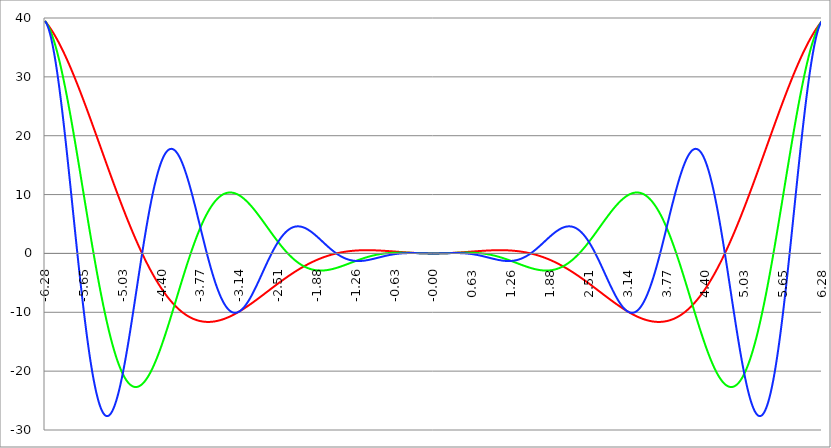
| Category | Series 1 | Series 0 | Series 2 |
|---|---|---|---|
| -6.283185307179586 | 39.478 | 39.478 | 39.478 |
| -6.276902121872407 | 39.399 | 39.396 | 39.393 |
| -6.270618936565228 | 39.318 | 39.308 | 39.293 |
| -6.264335751258049 | 39.235 | 39.214 | 39.179 |
| -6.25805256595087 | 39.151 | 39.114 | 39.052 |
| -6.25176938064369 | 39.065 | 39.007 | 38.911 |
| -6.245486195336511 | 38.978 | 38.895 | 38.757 |
| -6.23920301002933 | 38.89 | 38.777 | 38.589 |
| -6.232919824722153 | 38.8 | 38.653 | 38.408 |
| -6.226636639414973 | 38.709 | 38.523 | 38.214 |
| -6.220353454107794 | 38.616 | 38.388 | 38.007 |
| -6.214070268800615 | 38.522 | 38.246 | 37.788 |
| -6.207787083493435 | 38.427 | 38.099 | 37.555 |
| -6.201503898186257 | 38.33 | 37.947 | 37.31 |
| -6.195220712879077 | 38.232 | 37.788 | 37.052 |
| -6.188937527571898 | 38.133 | 37.624 | 36.782 |
| -6.182654342264719 | 38.032 | 37.455 | 36.5 |
| -6.17637115695754 | 37.93 | 37.28 | 36.206 |
| -6.170087971650361 | 37.827 | 37.1 | 35.9 |
| -6.163804786343182 | 37.722 | 36.915 | 35.582 |
| -6.157521601036002 | 37.616 | 36.724 | 35.253 |
| -6.151238415728823 | 37.509 | 36.528 | 34.912 |
| -6.144955230421644 | 37.4 | 36.327 | 34.56 |
| -6.138672045114464 | 37.29 | 36.12 | 34.197 |
| -6.132388859807286 | 37.179 | 35.909 | 33.823 |
| -6.126105674500106 | 37.067 | 35.692 | 33.439 |
| -6.119822489192927 | 36.954 | 35.471 | 33.044 |
| -6.113539303885748 | 36.839 | 35.245 | 32.639 |
| -6.107256118578569 | 36.723 | 35.013 | 32.223 |
| -6.10097293327139 | 36.606 | 34.777 | 31.798 |
| -6.09468974796421 | 36.487 | 34.537 | 31.363 |
| -6.088406562657031 | 36.368 | 34.291 | 30.918 |
| -6.082123377349852 | 36.247 | 34.041 | 30.464 |
| -6.075840192042672 | 36.125 | 33.787 | 30.001 |
| -6.069557006735494 | 36.002 | 33.528 | 29.529 |
| -6.063273821428314 | 35.878 | 33.264 | 29.049 |
| -6.056990636121135 | 35.753 | 32.997 | 28.56 |
| -6.050707450813956 | 35.626 | 32.724 | 28.062 |
| -6.044424265506777 | 35.499 | 32.448 | 27.557 |
| -6.038141080199597 | 35.37 | 32.168 | 27.043 |
| -6.031857894892418 | 35.24 | 31.883 | 26.522 |
| -6.025574709585239 | 35.109 | 31.594 | 25.994 |
| -6.01929152427806 | 34.978 | 31.302 | 25.458 |
| -6.013008338970881 | 34.845 | 31.005 | 24.916 |
| -6.006725153663701 | 34.711 | 30.705 | 24.367 |
| -6.000441968356522 | 34.576 | 30.4 | 23.811 |
| -5.994158783049343 | 34.44 | 30.092 | 23.249 |
| -5.987875597742164 | 34.303 | 29.781 | 22.681 |
| -5.981592412434984 | 34.165 | 29.466 | 22.107 |
| -5.975309227127805 | 34.025 | 29.147 | 21.527 |
| -5.969026041820626 | 33.885 | 28.825 | 20.942 |
| -5.962742856513447 | 33.744 | 28.499 | 20.352 |
| -5.956459671206268 | 33.602 | 28.17 | 19.758 |
| -5.950176485899088 | 33.46 | 27.838 | 19.158 |
| -5.94389330059191 | 33.316 | 27.503 | 18.554 |
| -5.93761011528473 | 33.171 | 27.165 | 17.946 |
| -5.931326929977551 | 33.025 | 26.823 | 17.334 |
| -5.925043744670372 | 32.879 | 26.479 | 16.719 |
| -5.918760559363193 | 32.731 | 26.132 | 16.1 |
| -5.912477374056014 | 32.583 | 25.782 | 15.478 |
| -5.906194188748834 | 32.434 | 25.429 | 14.853 |
| -5.899911003441655 | 32.283 | 25.073 | 14.225 |
| -5.893627818134476 | 32.132 | 24.715 | 13.594 |
| -5.887344632827297 | 31.981 | 24.354 | 12.962 |
| -5.881061447520117 | 31.828 | 23.991 | 12.327 |
| -5.874778262212938 | 31.674 | 23.626 | 11.691 |
| -5.868495076905759 | 31.52 | 23.258 | 11.053 |
| -5.86221189159858 | 31.365 | 22.888 | 10.414 |
| -5.855928706291401 | 31.209 | 22.516 | 9.774 |
| -5.849645520984221 | 31.053 | 22.141 | 9.133 |
| -5.843362335677042 | 30.895 | 21.765 | 8.491 |
| -5.837079150369863 | 30.737 | 21.386 | 7.85 |
| -5.830795965062684 | 30.578 | 21.006 | 7.208 |
| -5.824512779755505 | 30.419 | 20.624 | 6.566 |
| -5.818229594448325 | 30.258 | 20.24 | 5.925 |
| -5.811946409141146 | 30.097 | 19.855 | 5.284 |
| -5.805663223833967 | 29.935 | 19.468 | 4.644 |
| -5.799380038526788 | 29.773 | 19.079 | 4.006 |
| -5.793096853219609 | 29.61 | 18.689 | 3.368 |
| -5.78681366791243 | 29.446 | 18.297 | 2.732 |
| -5.780530482605251 | 29.281 | 17.904 | 2.098 |
| -5.774247297298071 | 29.116 | 17.51 | 1.466 |
| -5.767964111990892 | 28.951 | 17.115 | 0.836 |
| -5.761680926683713 | 28.784 | 16.719 | 0.209 |
| -5.755397741376534 | 28.617 | 16.321 | -0.416 |
| -5.749114556069355 | 28.45 | 15.923 | -1.038 |
| -5.742831370762175 | 28.281 | 15.524 | -1.657 |
| -5.736548185454996 | 28.113 | 15.124 | -2.273 |
| -5.730265000147816 | 27.943 | 14.723 | -2.885 |
| -5.723981814840638 | 27.773 | 14.322 | -3.493 |
| -5.717698629533459 | 27.603 | 13.92 | -4.097 |
| -5.711415444226279 | 27.432 | 13.517 | -4.698 |
| -5.7051322589191 | 27.26 | 13.114 | -5.294 |
| -5.698849073611921 | 27.088 | 12.711 | -5.885 |
| -5.692565888304742 | 26.916 | 12.307 | -6.472 |
| -5.686282702997562 | 26.743 | 11.903 | -7.053 |
| -5.679999517690383 | 26.569 | 11.499 | -7.63 |
| -5.673716332383204 | 26.395 | 11.094 | -8.201 |
| -5.667433147076025 | 26.221 | 10.69 | -8.767 |
| -5.661149961768846 | 26.046 | 10.286 | -9.327 |
| -5.654866776461667 | 25.87 | 9.882 | -9.882 |
| -5.648583591154487 | 25.695 | 9.478 | -10.43 |
| -5.642300405847308 | 25.518 | 9.074 | -10.972 |
| -5.63601722054013 | 25.342 | 8.67 | -11.508 |
| -5.62973403523295 | 25.165 | 8.267 | -12.037 |
| -5.623450849925771 | 24.987 | 7.864 | -12.559 |
| -5.617167664618591 | 24.809 | 7.462 | -13.075 |
| -5.610884479311412 | 24.631 | 7.06 | -13.583 |
| -5.604601294004233 | 24.453 | 6.659 | -14.084 |
| -5.598318108697054 | 24.274 | 6.259 | -14.578 |
| -5.592034923389875 | 24.095 | 5.86 | -15.065 |
| -5.585751738082695 | 23.915 | 5.461 | -15.544 |
| -5.579468552775516 | 23.735 | 5.063 | -16.015 |
| -5.573185367468337 | 23.555 | 4.666 | -16.478 |
| -5.566902182161157 | 23.375 | 4.27 | -16.933 |
| -5.560618996853979 | 23.194 | 3.875 | -17.38 |
| -5.5543358115468 | 23.013 | 3.482 | -17.818 |
| -5.54805262623962 | 22.831 | 3.089 | -18.249 |
| -5.54176944093244 | 22.65 | 2.698 | -18.67 |
| -5.535486255625262 | 22.468 | 2.308 | -19.083 |
| -5.529203070318083 | 22.286 | 1.92 | -19.487 |
| -5.522919885010904 | 22.104 | 1.533 | -19.883 |
| -5.516636699703724 | 21.921 | 1.147 | -20.269 |
| -5.510353514396545 | 21.739 | 0.763 | -20.646 |
| -5.504070329089366 | 21.556 | 0.381 | -21.014 |
| -5.497787143782186 | 21.373 | 0 | -21.373 |
| -5.491503958475008 | 21.19 | -0.379 | -21.722 |
| -5.485220773167828 | 21.006 | -0.756 | -22.062 |
| -5.47893758786065 | 20.823 | -1.131 | -22.392 |
| -5.47265440255347 | 20.639 | -1.505 | -22.713 |
| -5.466371217246291 | 20.455 | -1.876 | -23.024 |
| -5.460088031939112 | 20.271 | -2.246 | -23.325 |
| -5.453804846631932 | 20.087 | -2.613 | -23.616 |
| -5.447521661324753 | 19.903 | -2.978 | -23.898 |
| -5.441238476017574 | 19.719 | -3.341 | -24.169 |
| -5.434955290710395 | 19.534 | -3.702 | -24.431 |
| -5.428672105403215 | 19.35 | -4.061 | -24.682 |
| -5.422388920096036 | 19.165 | -4.417 | -24.924 |
| -5.416105734788857 | 18.981 | -4.771 | -25.155 |
| -5.409822549481678 | 18.796 | -5.122 | -25.376 |
| -5.403539364174499 | 18.612 | -5.471 | -25.587 |
| -5.39725617886732 | 18.427 | -5.818 | -25.787 |
| -5.39097299356014 | 18.242 | -6.161 | -25.977 |
| -5.384689808252961 | 18.058 | -6.503 | -26.157 |
| -5.378406622945782 | 17.873 | -6.841 | -26.327 |
| -5.372123437638603 | 17.688 | -7.177 | -26.486 |
| -5.365840252331424 | 17.504 | -7.51 | -26.635 |
| -5.359557067024244 | 17.319 | -7.841 | -26.774 |
| -5.353273881717065 | 17.134 | -8.168 | -26.902 |
| -5.346990696409886 | 16.95 | -8.493 | -27.02 |
| -5.340707511102707 | 16.765 | -8.814 | -27.127 |
| -5.334424325795528 | 16.581 | -9.133 | -27.224 |
| -5.328141140488348 | 16.397 | -9.448 | -27.311 |
| -5.32185795518117 | 16.213 | -9.761 | -27.388 |
| -5.31557476987399 | 16.028 | -10.071 | -27.454 |
| -5.30929158456681 | 15.844 | -10.377 | -27.51 |
| -5.303008399259631 | 15.66 | -10.68 | -27.555 |
| -5.296725213952453 | 15.477 | -10.98 | -27.591 |
| -5.290442028645273 | 15.293 | -11.277 | -27.616 |
| -5.284158843338094 | 15.109 | -11.57 | -27.631 |
| -5.277875658030915 | 14.926 | -11.86 | -27.636 |
| -5.271592472723735 | 14.743 | -12.147 | -27.631 |
| -5.265309287416557 | 14.56 | -12.431 | -27.616 |
| -5.259026102109377 | 14.377 | -12.711 | -27.591 |
| -5.252742916802198 | 14.194 | -12.987 | -27.556 |
| -5.246459731495019 | 14.012 | -13.26 | -27.512 |
| -5.24017654618784 | 13.829 | -13.53 | -27.457 |
| -5.23389336088066 | 13.647 | -13.796 | -27.393 |
| -5.227610175573481 | 13.465 | -14.059 | -27.319 |
| -5.221326990266302 | 13.284 | -14.317 | -27.236 |
| -5.215043804959122 | 13.102 | -14.573 | -27.143 |
| -5.208760619651944 | 12.921 | -14.824 | -27.041 |
| -5.202477434344764 | 12.74 | -15.072 | -26.929 |
| -5.196194249037585 | 12.559 | -15.317 | -26.808 |
| -5.189911063730406 | 12.379 | -15.557 | -26.678 |
| -5.183627878423227 | 12.199 | -15.794 | -26.539 |
| -5.177344693116048 | 12.019 | -16.027 | -26.391 |
| -5.171061507808868 | 11.839 | -16.256 | -26.234 |
| -5.164778322501689 | 11.66 | -16.481 | -26.069 |
| -5.15849513719451 | 11.481 | -16.703 | -25.894 |
| -5.152211951887331 | 11.302 | -16.921 | -25.711 |
| -5.145928766580152 | 11.124 | -17.134 | -25.52 |
| -5.139645581272972 | 10.946 | -17.344 | -25.32 |
| -5.133362395965793 | 10.768 | -17.55 | -25.112 |
| -5.127079210658614 | 10.591 | -17.752 | -24.896 |
| -5.120796025351435 | 10.414 | -17.951 | -24.672 |
| -5.114512840044256 | 10.238 | -18.145 | -24.44 |
| -5.108229654737076 | 10.061 | -18.335 | -24.201 |
| -5.101946469429897 | 9.886 | -18.521 | -23.954 |
| -5.095663284122718 | 9.71 | -18.703 | -23.699 |
| -5.08938009881554 | 9.535 | -18.882 | -23.437 |
| -5.08309691350836 | 9.36 | -19.056 | -23.167 |
| -5.07681372820118 | 9.186 | -19.226 | -22.891 |
| -5.070530542894002 | 9.012 | -19.392 | -22.607 |
| -5.064247357586822 | 8.839 | -19.554 | -22.317 |
| -5.057964172279643 | 8.666 | -19.712 | -22.02 |
| -5.051680986972464 | 8.493 | -19.866 | -21.717 |
| -5.045397801665285 | 8.321 | -20.016 | -21.407 |
| -5.039114616358106 | 8.15 | -20.162 | -21.091 |
| -5.032831431050926 | 7.978 | -20.303 | -20.769 |
| -5.026548245743747 | 7.808 | -20.441 | -20.441 |
| -5.020265060436568 | 7.637 | -20.574 | -20.107 |
| -5.013981875129389 | 7.468 | -20.704 | -19.767 |
| -5.00769868982221 | 7.298 | -20.829 | -19.422 |
| -5.00141550451503 | 7.13 | -20.95 | -19.072 |
| -4.995132319207851 | 6.961 | -21.067 | -18.716 |
| -4.98884913390067 | 6.793 | -21.18 | -18.356 |
| -4.982565948593493 | 6.626 | -21.289 | -17.99 |
| -4.976282763286313 | 6.459 | -21.394 | -17.62 |
| -4.969999577979134 | 6.293 | -21.494 | -17.245 |
| -4.963716392671955 | 6.127 | -21.591 | -16.866 |
| -4.957433207364776 | 5.962 | -21.683 | -16.483 |
| -4.951150022057597 | 5.798 | -21.772 | -16.095 |
| -4.944866836750418 | 5.633 | -21.856 | -15.704 |
| -4.938583651443238 | 5.47 | -21.936 | -15.309 |
| -4.932300466136059 | 5.307 | -22.012 | -14.911 |
| -4.92601728082888 | 5.144 | -22.084 | -14.509 |
| -4.9197340955217 | 4.983 | -22.152 | -14.103 |
| -4.913450910214521 | 4.821 | -22.216 | -13.695 |
| -4.907167724907342 | 4.661 | -22.276 | -13.284 |
| -4.900884539600163 | 4.501 | -22.332 | -12.87 |
| -4.894601354292984 | 4.341 | -22.384 | -12.453 |
| -4.888318168985805 | 4.182 | -22.432 | -12.034 |
| -4.882034983678625 | 4.024 | -22.475 | -11.613 |
| -4.875751798371446 | 3.866 | -22.515 | -11.19 |
| -4.869468613064267 | 3.709 | -22.551 | -10.765 |
| -4.863185427757088 | 3.553 | -22.583 | -10.338 |
| -4.856902242449909 | 3.397 | -22.611 | -9.91 |
| -4.85061905714273 | 3.242 | -22.635 | -9.48 |
| -4.84433587183555 | 3.087 | -22.655 | -9.049 |
| -4.838052686528371 | 2.934 | -22.671 | -8.617 |
| -4.831769501221192 | 2.78 | -22.684 | -8.184 |
| -4.825486315914013 | 2.628 | -22.692 | -7.75 |
| -4.819203130606833 | 2.476 | -22.697 | -7.315 |
| -4.812919945299654 | 2.325 | -22.698 | -6.881 |
| -4.806636759992475 | 2.174 | -22.695 | -6.446 |
| -4.800353574685296 | 2.024 | -22.688 | -6.011 |
| -4.794070389378117 | 1.875 | -22.677 | -5.576 |
| -4.787787204070938 | 1.727 | -22.663 | -5.141 |
| -4.781504018763758 | 1.579 | -22.645 | -4.707 |
| -4.77522083345658 | 1.432 | -22.623 | -4.273 |
| -4.7689376481494 | 1.285 | -22.597 | -3.84 |
| -4.762654462842221 | 1.14 | -22.568 | -3.408 |
| -4.756371277535042 | 0.995 | -22.536 | -2.976 |
| -4.750088092227862 | 0.85 | -22.499 | -2.546 |
| -4.743804906920683 | 0.707 | -22.459 | -2.118 |
| -4.737521721613504 | 0.564 | -22.416 | -1.691 |
| -4.731238536306324 | 0.422 | -22.369 | -1.265 |
| -4.724955350999146 | 0.281 | -22.318 | -0.841 |
| -4.718672165691966 | 0.14 | -22.264 | -0.42 |
| -4.712388980384787 | 0 | -22.207 | 0 |
| -4.706105795077608 | -0.139 | -22.146 | 0.417 |
| -4.699822609770429 | -0.278 | -22.081 | 0.833 |
| -4.69353942446325 | -0.415 | -22.014 | 1.245 |
| -4.68725623915607 | -0.552 | -21.943 | 1.655 |
| -4.680973053848891 | -0.688 | -21.868 | 2.062 |
| -4.674689868541712 | -0.824 | -21.791 | 2.466 |
| -4.668406683234533 | -0.958 | -21.71 | 2.867 |
| -4.662123497927354 | -1.092 | -21.626 | 3.265 |
| -4.655840312620174 | -1.225 | -21.538 | 3.66 |
| -4.649557127312995 | -1.357 | -21.448 | 4.051 |
| -4.643273942005816 | -1.489 | -21.354 | 4.438 |
| -4.636990756698637 | -1.62 | -21.258 | 4.822 |
| -4.630707571391458 | -1.75 | -21.158 | 5.202 |
| -4.624424386084279 | -1.879 | -21.055 | 5.578 |
| -4.618141200777099 | -2.007 | -20.949 | 5.95 |
| -4.61185801546992 | -2.135 | -20.841 | 6.318 |
| -4.605574830162741 | -2.261 | -20.729 | 6.681 |
| -4.599291644855561 | -2.387 | -20.615 | 7.04 |
| -4.593008459548383 | -2.512 | -20.497 | 7.395 |
| -4.586725274241203 | -2.637 | -20.377 | 7.745 |
| -4.580442088934024 | -2.76 | -20.254 | 8.09 |
| -4.574158903626845 | -2.883 | -20.128 | 8.43 |
| -4.567875718319666 | -3.005 | -20 | 8.765 |
| -4.561592533012487 | -3.126 | -19.869 | 9.096 |
| -4.555309347705307 | -3.246 | -19.735 | 9.421 |
| -4.549026162398128 | -3.366 | -19.599 | 9.741 |
| -4.542742977090949 | -3.484 | -19.46 | 10.055 |
| -4.53645979178377 | -3.602 | -19.319 | 10.364 |
| -4.530176606476591 | -3.719 | -19.175 | 10.668 |
| -4.523893421169412 | -3.835 | -19.028 | 10.966 |
| -4.517610235862232 | -3.95 | -18.88 | 11.258 |
| -4.511327050555053 | -4.065 | -18.729 | 11.545 |
| -4.505043865247874 | -4.178 | -18.575 | 11.826 |
| -4.498760679940694 | -4.291 | -18.419 | 12.101 |
| -4.492477494633515 | -4.403 | -18.262 | 12.37 |
| -4.486194309326336 | -4.514 | -18.101 | 12.633 |
| -4.479911124019157 | -4.624 | -17.939 | 12.89 |
| -4.473627938711977 | -4.733 | -17.775 | 13.14 |
| -4.467344753404799 | -4.842 | -17.608 | 13.385 |
| -4.46106156809762 | -4.949 | -17.439 | 13.623 |
| -4.45477838279044 | -5.056 | -17.269 | 13.855 |
| -4.44849519748326 | -5.162 | -17.096 | 14.081 |
| -4.442212012176082 | -5.267 | -16.922 | 14.3 |
| -4.435928826868903 | -5.371 | -16.745 | 14.512 |
| -4.429645641561723 | -5.474 | -16.567 | 14.718 |
| -4.423362456254544 | -5.577 | -16.387 | 14.918 |
| -4.417079270947365 | -5.678 | -16.205 | 15.111 |
| -4.410796085640185 | -5.779 | -16.022 | 15.297 |
| -4.404512900333007 | -5.879 | -15.837 | 15.477 |
| -4.398229715025827 | -5.978 | -15.65 | 15.65 |
| -4.391946529718648 | -6.076 | -15.462 | 15.816 |
| -4.38566334441147 | -6.173 | -15.272 | 15.976 |
| -4.37938015910429 | -6.269 | -15.08 | 16.128 |
| -4.373096973797111 | -6.365 | -14.887 | 16.274 |
| -4.366813788489932 | -6.459 | -14.693 | 16.414 |
| -4.360530603182752 | -6.553 | -14.497 | 16.546 |
| -4.354247417875573 | -6.646 | -14.3 | 16.671 |
| -4.347964232568394 | -6.738 | -14.102 | 16.79 |
| -4.341681047261215 | -6.829 | -13.902 | 16.902 |
| -4.335397861954035 | -6.919 | -13.701 | 17.007 |
| -4.329114676646856 | -7.008 | -13.499 | 17.105 |
| -4.322831491339677 | -7.097 | -13.296 | 17.196 |
| -4.316548306032498 | -7.184 | -13.092 | 17.281 |
| -4.310265120725319 | -7.271 | -12.887 | 17.358 |
| -4.30398193541814 | -7.357 | -12.681 | 17.429 |
| -4.29769875011096 | -7.442 | -12.474 | 17.493 |
| -4.291415564803781 | -7.526 | -12.265 | 17.55 |
| -4.285132379496602 | -7.609 | -12.056 | 17.601 |
| -4.278849194189422 | -7.691 | -11.847 | 17.644 |
| -4.272566008882244 | -7.773 | -11.636 | 17.681 |
| -4.266282823575064 | -7.853 | -11.425 | 17.712 |
| -4.259999638267885 | -7.933 | -11.213 | 17.735 |
| -4.253716452960706 | -8.011 | -11 | 17.752 |
| -4.247433267653527 | -8.089 | -10.787 | 17.762 |
| -4.241150082346347 | -8.166 | -10.573 | 17.766 |
| -4.234866897039168 | -8.242 | -10.358 | 17.763 |
| -4.228583711731989 | -8.317 | -10.143 | 17.754 |
| -4.22230052642481 | -8.392 | -9.928 | 17.738 |
| -4.216017341117631 | -8.465 | -9.712 | 17.716 |
| -4.209734155810452 | -8.538 | -9.496 | 17.687 |
| -4.203450970503273 | -8.609 | -9.279 | 17.652 |
| -4.197167785196093 | -8.68 | -9.062 | 17.611 |
| -4.190884599888914 | -8.75 | -8.845 | 17.563 |
| -4.184601414581734 | -8.819 | -8.628 | 17.51 |
| -4.178318229274556 | -8.887 | -8.411 | 17.45 |
| -4.172035043967377 | -8.954 | -8.193 | 17.384 |
| -4.165751858660197 | -9.021 | -7.975 | 17.312 |
| -4.159468673353018 | -9.086 | -7.758 | 17.234 |
| -4.153185488045839 | -9.151 | -7.54 | 17.151 |
| -4.14690230273866 | -9.215 | -7.322 | 17.061 |
| -4.140619117431481 | -9.277 | -7.104 | 16.966 |
| -4.134335932124301 | -9.339 | -6.887 | 16.865 |
| -4.128052746817122 | -9.4 | -6.669 | 16.759 |
| -4.121769561509943 | -9.461 | -6.452 | 16.647 |
| -4.115486376202764 | -9.52 | -6.235 | 16.529 |
| -4.109203190895584 | -9.579 | -6.018 | 16.407 |
| -4.102920005588405 | -9.636 | -5.802 | 16.278 |
| -4.096636820281226 | -9.693 | -5.586 | 16.145 |
| -4.090353634974047 | -9.749 | -5.37 | 16.007 |
| -4.084070449666868 | -9.804 | -5.154 | 15.863 |
| -4.077787264359689 | -9.858 | -4.939 | 15.715 |
| -4.071504079052509 | -9.912 | -4.725 | 15.562 |
| -4.06522089374533 | -9.964 | -4.511 | 15.403 |
| -4.058937708438151 | -10.016 | -4.297 | 15.241 |
| -4.052654523130972 | -10.066 | -4.084 | 15.073 |
| -4.046371337823793 | -10.116 | -3.872 | 14.901 |
| -4.040088152516613 | -10.165 | -3.661 | 14.725 |
| -4.033804967209434 | -10.214 | -3.45 | 14.544 |
| -4.027521781902255 | -10.261 | -3.239 | 14.359 |
| -4.021238596595076 | -10.307 | -3.03 | 14.17 |
| -4.014955411287897 | -10.353 | -2.821 | 13.977 |
| -4.008672225980717 | -10.398 | -2.613 | 13.78 |
| -4.002389040673538 | -10.442 | -2.406 | 13.579 |
| -3.996105855366359 | -10.485 | -2.2 | 13.374 |
| -3.989822670059179 | -10.527 | -1.995 | 13.166 |
| -3.983539484752 | -10.569 | -1.791 | 12.954 |
| -3.97725629944482 | -10.609 | -1.588 | 12.739 |
| -3.97097311413764 | -10.649 | -1.385 | 12.52 |
| -3.96468992883046 | -10.688 | -1.184 | 12.298 |
| -3.958406743523281 | -10.726 | -0.984 | 12.073 |
| -3.952123558216101 | -10.763 | -0.785 | 11.845 |
| -3.945840372908922 | -10.8 | -0.587 | 11.614 |
| -3.939557187601742 | -10.836 | -0.39 | 11.38 |
| -3.933274002294562 | -10.87 | -0.194 | 11.144 |
| -3.926990816987382 | -10.904 | 0 | 10.904 |
| -3.920707631680203 | -10.938 | 0.193 | 10.663 |
| -3.914424446373023 | -10.97 | 0.385 | 10.419 |
| -3.908141261065844 | -11.002 | 0.576 | 10.172 |
| -3.901858075758664 | -11.032 | 0.765 | 9.924 |
| -3.895574890451484 | -11.062 | 0.953 | 9.673 |
| -3.889291705144305 | -11.092 | 1.139 | 9.421 |
| -3.883008519837125 | -11.12 | 1.325 | 9.166 |
| -3.876725334529945 | -11.148 | 1.508 | 8.91 |
| -3.870442149222766 | -11.174 | 1.691 | 8.652 |
| -3.864158963915586 | -11.2 | 1.871 | 8.393 |
| -3.857875778608407 | -11.226 | 2.051 | 8.132 |
| -3.851592593301227 | -11.25 | 2.229 | 7.87 |
| -3.845309407994047 | -11.274 | 2.405 | 7.607 |
| -3.839026222686868 | -11.297 | 2.58 | 7.342 |
| -3.832743037379688 | -11.319 | 2.753 | 7.077 |
| -3.826459852072508 | -11.34 | 2.924 | 6.811 |
| -3.820176666765329 | -11.361 | 3.094 | 6.544 |
| -3.813893481458149 | -11.38 | 3.262 | 6.276 |
| -3.807610296150969 | -11.4 | 3.429 | 6.008 |
| -3.80132711084379 | -11.418 | 3.594 | 5.739 |
| -3.79504392553661 | -11.435 | 3.757 | 5.47 |
| -3.78876074022943 | -11.452 | 3.918 | 5.2 |
| -3.782477554922251 | -11.468 | 4.078 | 4.931 |
| -3.776194369615071 | -11.483 | 4.236 | 4.661 |
| -3.769911184307892 | -11.498 | 4.392 | 4.392 |
| -3.763627999000712 | -11.512 | 4.546 | 4.122 |
| -3.757344813693532 | -11.525 | 4.699 | 3.853 |
| -3.751061628386352 | -11.537 | 4.849 | 3.585 |
| -3.744778443079173 | -11.549 | 4.998 | 3.317 |
| -3.738495257771993 | -11.56 | 5.145 | 3.049 |
| -3.732212072464814 | -11.57 | 5.29 | 2.782 |
| -3.725928887157634 | -11.579 | 5.433 | 2.516 |
| -3.719645701850454 | -11.588 | 5.575 | 2.25 |
| -3.713362516543275 | -11.596 | 5.714 | 1.986 |
| -3.707079331236095 | -11.603 | 5.851 | 1.722 |
| -3.700796145928915 | -11.61 | 5.987 | 1.46 |
| -3.694512960621736 | -11.616 | 6.12 | 1.199 |
| -3.688229775314556 | -11.621 | 6.252 | 0.939 |
| -3.681946590007376 | -11.625 | 6.381 | 0.681 |
| -3.675663404700197 | -11.629 | 6.509 | 0.424 |
| -3.669380219393017 | -11.632 | 6.634 | 0.169 |
| -3.663097034085838 | -11.635 | 6.758 | -0.084 |
| -3.656813848778658 | -11.636 | 6.879 | -0.336 |
| -3.650530663471478 | -11.637 | 6.999 | -0.586 |
| -3.644247478164299 | -11.638 | 7.116 | -0.834 |
| -3.63796429285712 | -11.638 | 7.231 | -1.08 |
| -3.631681107549939 | -11.637 | 7.345 | -1.324 |
| -3.62539792224276 | -11.635 | 7.456 | -1.565 |
| -3.61911473693558 | -11.633 | 7.565 | -1.805 |
| -3.612831551628401 | -11.63 | 7.672 | -2.042 |
| -3.606548366321221 | -11.626 | 7.777 | -2.277 |
| -3.600265181014041 | -11.622 | 7.88 | -2.509 |
| -3.593981995706862 | -11.617 | 7.981 | -2.738 |
| -3.587698810399682 | -11.612 | 8.079 | -2.965 |
| -3.581415625092502 | -11.606 | 8.176 | -3.19 |
| -3.575132439785323 | -11.599 | 8.27 | -3.411 |
| -3.568849254478143 | -11.592 | 8.363 | -3.63 |
| -3.562566069170964 | -11.584 | 8.453 | -3.846 |
| -3.556282883863784 | -11.575 | 8.541 | -4.059 |
| -3.549999698556604 | -11.566 | 8.627 | -4.269 |
| -3.543716513249425 | -11.556 | 8.711 | -4.476 |
| -3.537433327942245 | -11.546 | 8.793 | -4.68 |
| -3.531150142635065 | -11.535 | 8.872 | -4.88 |
| -3.524866957327886 | -11.523 | 8.95 | -5.077 |
| -3.518583772020706 | -11.511 | 9.025 | -5.271 |
| -3.512300586713526 | -11.498 | 9.098 | -5.462 |
| -3.506017401406347 | -11.485 | 9.169 | -5.649 |
| -3.499734216099167 | -11.471 | 9.238 | -5.833 |
| -3.493451030791987 | -11.456 | 9.305 | -6.013 |
| -3.487167845484808 | -11.441 | 9.37 | -6.19 |
| -3.480884660177628 | -11.426 | 9.432 | -6.363 |
| -3.474601474870449 | -11.41 | 9.493 | -6.533 |
| -3.468318289563269 | -11.393 | 9.551 | -6.699 |
| -3.462035104256089 | -11.376 | 9.607 | -6.861 |
| -3.45575191894891 | -11.358 | 9.661 | -7.019 |
| -3.44946873364173 | -11.339 | 9.713 | -7.174 |
| -3.44318554833455 | -11.32 | 9.763 | -7.325 |
| -3.436902363027371 | -11.301 | 9.811 | -7.472 |
| -3.430619177720191 | -11.281 | 9.857 | -7.615 |
| -3.424335992413011 | -11.26 | 9.901 | -7.755 |
| -3.418052807105832 | -11.239 | 9.942 | -7.89 |
| -3.411769621798652 | -11.218 | 9.982 | -8.021 |
| -3.405486436491473 | -11.196 | 10.019 | -8.149 |
| -3.399203251184293 | -11.173 | 10.055 | -8.272 |
| -3.392920065877113 | -11.15 | 10.088 | -8.392 |
| -3.386636880569934 | -11.127 | 10.119 | -8.507 |
| -3.380353695262754 | -11.103 | 10.149 | -8.619 |
| -3.374070509955574 | -11.078 | 10.176 | -8.726 |
| -3.367787324648395 | -11.053 | 10.201 | -8.829 |
| -3.361504139341215 | -11.028 | 10.224 | -8.929 |
| -3.355220954034035 | -11.002 | 10.246 | -9.024 |
| -3.348937768726855 | -10.975 | 10.265 | -9.115 |
| -3.342654583419676 | -10.948 | 10.282 | -9.202 |
| -3.336371398112496 | -10.921 | 10.297 | -9.284 |
| -3.330088212805317 | -10.893 | 10.311 | -9.363 |
| -3.323805027498137 | -10.865 | 10.322 | -9.438 |
| -3.317521842190957 | -10.836 | 10.332 | -9.508 |
| -3.311238656883778 | -10.807 | 10.339 | -9.575 |
| -3.304955471576598 | -10.777 | 10.345 | -9.637 |
| -3.298672286269419 | -10.747 | 10.349 | -9.695 |
| -3.292389100962239 | -10.717 | 10.351 | -9.749 |
| -3.286105915655059 | -10.686 | 10.351 | -9.799 |
| -3.27982273034788 | -10.655 | 10.349 | -9.845 |
| -3.2735395450407 | -10.623 | 10.345 | -9.887 |
| -3.26725635973352 | -10.591 | 10.34 | -9.925 |
| -3.260973174426341 | -10.558 | 10.332 | -9.959 |
| -3.254689989119161 | -10.525 | 10.323 | -9.989 |
| -3.248406803811982 | -10.492 | 10.312 | -10.015 |
| -3.242123618504802 | -10.458 | 10.3 | -10.037 |
| -3.235840433197622 | -10.424 | 10.285 | -10.055 |
| -3.229557247890442 | -10.39 | 10.269 | -10.069 |
| -3.223274062583263 | -10.355 | 10.251 | -10.079 |
| -3.216990877276083 | -10.32 | 10.232 | -10.085 |
| -3.210707691968904 | -10.284 | 10.21 | -10.088 |
| -3.204424506661724 | -10.248 | 10.187 | -10.086 |
| -3.198141321354544 | -10.212 | 10.163 | -10.081 |
| -3.191858136047365 | -10.175 | 10.137 | -10.072 |
| -3.185574950740185 | -10.138 | 10.109 | -10.06 |
| -3.179291765433005 | -10.101 | 10.079 | -10.043 |
| -3.173008580125826 | -10.063 | 10.048 | -10.023 |
| -3.166725394818646 | -10.025 | 10.015 | -10 |
| -3.160442209511467 | -9.987 | 9.981 | -9.972 |
| -3.154159024204287 | -9.948 | 9.946 | -9.942 |
| -3.147875838897107 | -9.909 | 9.908 | -9.907 |
| -3.141592653589928 | -9.87 | 9.87 | -9.87 |
| -3.135309468282748 | -9.83 | 9.829 | -9.828 |
| -3.129026282975568 | -9.79 | 9.788 | -9.784 |
| -3.122743097668389 | -9.75 | 9.745 | -9.736 |
| -3.116459912361209 | -9.709 | 9.7 | -9.685 |
| -3.110176727054029 | -9.668 | 9.654 | -9.63 |
| -3.10389354174685 | -9.627 | 9.607 | -9.573 |
| -3.09761035643967 | -9.586 | 9.558 | -9.512 |
| -3.09132717113249 | -9.544 | 9.508 | -9.448 |
| -3.085043985825311 | -9.502 | 9.457 | -9.381 |
| -3.078760800518131 | -9.46 | 9.404 | -9.311 |
| -3.072477615210952 | -9.418 | 9.35 | -9.238 |
| -3.066194429903772 | -9.375 | 9.295 | -9.162 |
| -3.059911244596592 | -9.332 | 9.238 | -9.083 |
| -3.053628059289413 | -9.289 | 9.181 | -9.002 |
| -3.047344873982233 | -9.245 | 9.122 | -8.918 |
| -3.041061688675053 | -9.201 | 9.062 | -8.831 |
| -3.034778503367874 | -9.157 | 9.001 | -8.741 |
| -3.028495318060694 | -9.113 | 8.938 | -8.649 |
| -3.022212132753515 | -9.069 | 8.875 | -8.554 |
| -3.015928947446335 | -9.024 | 8.81 | -8.457 |
| -3.009645762139155 | -8.979 | 8.744 | -8.358 |
| -3.003362576831975 | -8.934 | 8.678 | -8.256 |
| -2.997079391524796 | -8.889 | 8.61 | -8.151 |
| -2.990796206217616 | -8.843 | 8.541 | -8.045 |
| -2.984513020910436 | -8.798 | 8.471 | -7.936 |
| -2.978229835603257 | -8.752 | 8.401 | -7.826 |
| -2.971946650296077 | -8.706 | 8.329 | -7.713 |
| -2.965663464988898 | -8.659 | 8.256 | -7.598 |
| -2.959380279681718 | -8.613 | 8.183 | -7.482 |
| -2.953097094374538 | -8.566 | 8.108 | -7.363 |
| -2.946813909067359 | -8.52 | 8.033 | -7.243 |
| -2.94053072376018 | -8.473 | 7.957 | -7.121 |
| -2.934247538453 | -8.425 | 7.88 | -6.997 |
| -2.92796435314582 | -8.378 | 7.802 | -6.872 |
| -2.92168116783864 | -8.331 | 7.724 | -6.745 |
| -2.915397982531461 | -8.283 | 7.645 | -6.617 |
| -2.909114797224281 | -8.235 | 7.565 | -6.487 |
| -2.902831611917101 | -8.187 | 7.484 | -6.356 |
| -2.896548426609922 | -8.139 | 7.402 | -6.223 |
| -2.890265241302742 | -8.091 | 7.32 | -6.09 |
| -2.883982055995562 | -8.043 | 7.238 | -5.955 |
| -2.877698870688383 | -7.994 | 7.154 | -5.819 |
| -2.871415685381203 | -7.946 | 7.07 | -5.682 |
| -2.865132500074023 | -7.897 | 6.986 | -5.544 |
| -2.858849314766844 | -7.848 | 6.901 | -5.405 |
| -2.852566129459664 | -7.8 | 6.815 | -5.265 |
| -2.846282944152485 | -7.751 | 6.729 | -5.125 |
| -2.839999758845305 | -7.702 | 6.642 | -4.983 |
| -2.833716573538125 | -7.652 | 6.555 | -4.841 |
| -2.827433388230946 | -7.603 | 6.468 | -4.699 |
| -2.821150202923766 | -7.554 | 6.38 | -4.556 |
| -2.814867017616586 | -7.504 | 6.291 | -4.412 |
| -2.808583832309407 | -7.455 | 6.202 | -4.268 |
| -2.802300647002227 | -7.405 | 6.113 | -4.124 |
| -2.796017461695047 | -7.356 | 6.024 | -3.98 |
| -2.789734276387867 | -7.306 | 5.934 | -3.835 |
| -2.783451091080688 | -7.256 | 5.844 | -3.69 |
| -2.777167905773509 | -7.206 | 5.753 | -3.545 |
| -2.770884720466329 | -7.156 | 5.662 | -3.399 |
| -2.764601535159149 | -7.106 | 5.572 | -3.254 |
| -2.75831834985197 | -7.056 | 5.48 | -3.109 |
| -2.75203516454479 | -7.006 | 5.389 | -2.964 |
| -2.74575197923761 | -6.956 | 5.297 | -2.819 |
| -2.739468793930431 | -6.906 | 5.206 | -2.675 |
| -2.733185608623251 | -6.856 | 5.114 | -2.53 |
| -2.726902423316071 | -6.806 | 5.022 | -2.387 |
| -2.720619238008892 | -6.756 | 4.93 | -2.243 |
| -2.714336052701712 | -6.705 | 4.837 | -2.1 |
| -2.708052867394532 | -6.655 | 4.745 | -1.957 |
| -2.701769682087352 | -6.605 | 4.653 | -1.815 |
| -2.695486496780173 | -6.555 | 4.561 | -1.674 |
| -2.689203311472993 | -6.504 | 4.468 | -1.533 |
| -2.682920126165814 | -6.454 | 4.376 | -1.393 |
| -2.676636940858634 | -6.404 | 4.284 | -1.254 |
| -2.670353755551454 | -6.354 | 4.191 | -1.116 |
| -2.664070570244275 | -6.303 | 4.099 | -0.978 |
| -2.657787384937095 | -6.253 | 4.007 | -0.841 |
| -2.651504199629916 | -6.203 | 3.915 | -0.706 |
| -2.645221014322736 | -6.153 | 3.823 | -0.571 |
| -2.638937829015556 | -6.103 | 3.731 | -0.437 |
| -2.632654643708377 | -6.052 | 3.64 | -0.305 |
| -2.626371458401197 | -6.002 | 3.549 | -0.173 |
| -2.620088273094018 | -5.952 | 3.457 | -0.043 |
| -2.613805087786838 | -5.902 | 3.366 | 0.086 |
| -2.607521902479658 | -5.852 | 3.276 | 0.214 |
| -2.601238717172478 | -5.802 | 3.185 | 0.34 |
| -2.594955531865299 | -5.753 | 3.095 | 0.465 |
| -2.588672346558119 | -5.703 | 3.005 | 0.589 |
| -2.58238916125094 | -5.653 | 2.915 | 0.711 |
| -2.57610597594376 | -5.603 | 2.826 | 0.832 |
| -2.56982279063658 | -5.554 | 2.737 | 0.951 |
| -2.563539605329401 | -5.504 | 2.648 | 1.069 |
| -2.557256420022221 | -5.455 | 2.559 | 1.185 |
| -2.550973234715042 | -5.405 | 2.471 | 1.3 |
| -2.544690049407862 | -5.356 | 2.384 | 1.413 |
| -2.538406864100682 | -5.306 | 2.297 | 1.524 |
| -2.532123678793503 | -5.257 | 2.21 | 1.634 |
| -2.525840493486323 | -5.208 | 2.123 | 1.741 |
| -2.519557308179143 | -5.159 | 2.037 | 1.848 |
| -2.513274122871964 | -5.11 | 1.952 | 1.952 |
| -2.506990937564784 | -5.061 | 1.867 | 2.054 |
| -2.500707752257604 | -5.013 | 1.782 | 2.155 |
| -2.494424566950425 | -4.964 | 1.698 | 2.254 |
| -2.488141381643245 | -4.915 | 1.615 | 2.351 |
| -2.481858196336065 | -4.867 | 1.532 | 2.446 |
| -2.475575011028886 | -4.819 | 1.449 | 2.539 |
| -2.469291825721706 | -4.771 | 1.367 | 2.631 |
| -2.463008640414527 | -4.722 | 1.286 | 2.72 |
| -2.456725455107347 | -4.675 | 1.205 | 2.807 |
| -2.450442269800167 | -4.627 | 1.125 | 2.893 |
| -2.444159084492988 | -4.579 | 1.046 | 2.976 |
| -2.437875899185808 | -4.531 | 0.967 | 3.057 |
| -2.431592713878628 | -4.484 | 0.888 | 3.137 |
| -2.425309528571449 | -4.437 | 0.81 | 3.214 |
| -2.419026343264269 | -4.389 | 0.733 | 3.289 |
| -2.412743157957089 | -4.342 | 0.657 | 3.362 |
| -2.40645997264991 | -4.295 | 0.581 | 3.433 |
| -2.40017678734273 | -4.249 | 0.506 | 3.502 |
| -2.393893602035551 | -4.202 | 0.432 | 3.569 |
| -2.387610416728371 | -4.156 | 0.358 | 3.634 |
| -2.381327231421191 | -4.109 | 0.285 | 3.696 |
| -2.375044046114012 | -4.063 | 0.213 | 3.757 |
| -2.368760860806832 | -4.017 | 0.141 | 3.815 |
| -2.362477675499652 | -3.971 | 0.07 | 3.871 |
| -2.356194490192473 | -3.926 | 0 | 3.926 |
| -2.349911304885293 | -3.88 | -0.069 | 3.978 |
| -2.343628119578113 | -3.835 | -0.138 | 4.027 |
| -2.337344934270934 | -3.79 | -0.206 | 4.075 |
| -2.331061748963754 | -3.745 | -0.273 | 4.121 |
| -2.324778563656574 | -3.7 | -0.339 | 4.164 |
| -2.318495378349395 | -3.655 | -0.405 | 4.206 |
| -2.312212193042215 | -3.611 | -0.47 | 4.245 |
| -2.305929007735036 | -3.566 | -0.534 | 4.282 |
| -2.299645822427856 | -3.522 | -0.597 | 4.317 |
| -2.293362637120676 | -3.478 | -0.659 | 4.35 |
| -2.287079451813496 | -3.434 | -0.721 | 4.381 |
| -2.280796266506317 | -3.391 | -0.781 | 4.41 |
| -2.274513081199137 | -3.347 | -0.841 | 4.436 |
| -2.268229895891957 | -3.304 | -0.9 | 4.461 |
| -2.261946710584778 | -3.261 | -0.959 | 4.484 |
| -2.255663525277598 | -3.219 | -1.016 | 4.504 |
| -2.249380339970419 | -3.176 | -1.073 | 4.523 |
| -2.24309715466324 | -3.134 | -1.128 | 4.539 |
| -2.23681396935606 | -3.091 | -1.183 | 4.554 |
| -2.23053078404888 | -3.049 | -1.237 | 4.566 |
| -2.2242475987417 | -3.008 | -1.29 | 4.577 |
| -2.217964413434521 | -2.966 | -1.343 | 4.585 |
| -2.211681228127341 | -2.925 | -1.394 | 4.592 |
| -2.205398042820161 | -2.884 | -1.445 | 4.597 |
| -2.199114857512981 | -2.843 | -1.494 | 4.599 |
| -2.192831672205802 | -2.802 | -1.543 | 4.6 |
| -2.186548486898622 | -2.761 | -1.591 | 4.599 |
| -2.180265301591443 | -2.721 | -1.638 | 4.597 |
| -2.173982116284263 | -2.681 | -1.684 | 4.592 |
| -2.167698930977084 | -2.641 | -1.73 | 4.586 |
| -2.161415745669904 | -2.602 | -1.774 | 4.578 |
| -2.155132560362724 | -2.562 | -1.818 | 4.568 |
| -2.148849375055545 | -2.523 | -1.86 | 4.556 |
| -2.142566189748365 | -2.484 | -1.902 | 4.543 |
| -2.136283004441185 | -2.445 | -1.943 | 4.528 |
| -2.129999819134006 | -2.407 | -1.983 | 4.511 |
| -2.123716633826826 | -2.369 | -2.022 | 4.493 |
| -2.117433448519646 | -2.331 | -2.061 | 4.473 |
| -2.111150263212467 | -2.293 | -2.098 | 4.451 |
| -2.104867077905287 | -2.255 | -2.134 | 4.428 |
| -2.098583892598107 | -2.218 | -2.17 | 4.404 |
| -2.092300707290928 | -2.181 | -2.205 | 4.378 |
| -2.086017521983748 | -2.144 | -2.239 | 4.35 |
| -2.079734336676569 | -2.108 | -2.272 | 4.321 |
| -2.073451151369389 | -2.071 | -2.304 | 4.291 |
| -2.06716796606221 | -2.035 | -2.335 | 4.259 |
| -2.06088478075503 | -1.999 | -2.365 | 4.226 |
| -2.05460159544785 | -1.964 | -2.395 | 4.191 |
| -2.04831841014067 | -1.928 | -2.423 | 4.156 |
| -2.042035224833491 | -1.893 | -2.451 | 4.119 |
| -2.035752039526311 | -1.858 | -2.478 | 4.08 |
| -2.029468854219131 | -1.824 | -2.504 | 4.041 |
| -2.023185668911951 | -1.789 | -2.529 | 4 |
| -2.016902483604772 | -1.755 | -2.553 | 3.958 |
| -2.010619298297592 | -1.721 | -2.577 | 3.916 |
| -2.004336112990412 | -1.688 | -2.599 | 3.872 |
| -1.998052927683233 | -1.654 | -2.621 | 3.827 |
| -1.991769742376054 | -1.621 | -2.642 | 3.781 |
| -1.985486557068874 | -1.588 | -2.662 | 3.734 |
| -1.979203371761694 | -1.556 | -2.682 | 3.686 |
| -1.972920186454515 | -1.523 | -2.7 | 3.637 |
| -1.966637001147335 | -1.491 | -2.718 | 3.587 |
| -1.960353815840155 | -1.459 | -2.734 | 3.536 |
| -1.954070630532976 | -1.428 | -2.75 | 3.485 |
| -1.947787445225796 | -1.397 | -2.766 | 3.433 |
| -1.941504259918616 | -1.366 | -2.78 | 3.38 |
| -1.935221074611437 | -1.335 | -2.794 | 3.326 |
| -1.928937889304257 | -1.304 | -2.806 | 3.272 |
| -1.922654703997078 | -1.274 | -2.818 | 3.217 |
| -1.916371518689898 | -1.244 | -2.83 | 3.161 |
| -1.910088333382718 | -1.214 | -2.84 | 3.105 |
| -1.903805148075539 | -1.185 | -2.85 | 3.048 |
| -1.897521962768359 | -1.156 | -2.859 | 2.991 |
| -1.891238777461179 | -1.127 | -2.867 | 2.933 |
| -1.884955592154 | -1.098 | -2.874 | 2.874 |
| -1.87867240684682 | -1.07 | -2.881 | 2.816 |
| -1.87238922153964 | -1.041 | -2.887 | 2.757 |
| -1.866106036232461 | -1.013 | -2.892 | 2.697 |
| -1.859822850925281 | -0.986 | -2.897 | 2.637 |
| -1.853539665618102 | -0.959 | -2.901 | 2.577 |
| -1.847256480310922 | -0.931 | -2.904 | 2.517 |
| -1.840973295003742 | -0.905 | -2.906 | 2.456 |
| -1.834690109696563 | -0.878 | -2.908 | 2.395 |
| -1.828406924389383 | -0.852 | -2.909 | 2.334 |
| -1.822123739082203 | -0.826 | -2.909 | 2.273 |
| -1.815840553775024 | -0.8 | -2.909 | 2.211 |
| -1.809557368467844 | -0.774 | -2.908 | 2.15 |
| -1.803274183160664 | -0.749 | -2.907 | 2.088 |
| -1.796990997853485 | -0.724 | -2.904 | 2.027 |
| -1.790707812546305 | -0.7 | -2.901 | 1.965 |
| -1.784424627239125 | -0.675 | -2.898 | 1.904 |
| -1.778141441931946 | -0.651 | -2.894 | 1.842 |
| -1.771858256624766 | -0.627 | -2.889 | 1.781 |
| -1.765575071317587 | -0.603 | -2.884 | 1.72 |
| -1.759291886010407 | -0.58 | -2.878 | 1.658 |
| -1.753008700703227 | -0.557 | -2.871 | 1.597 |
| -1.746725515396048 | -0.534 | -2.864 | 1.537 |
| -1.740442330088868 | -0.511 | -2.856 | 1.476 |
| -1.734159144781688 | -0.489 | -2.848 | 1.416 |
| -1.727875959474509 | -0.467 | -2.839 | 1.355 |
| -1.72159277416733 | -0.445 | -2.83 | 1.296 |
| -1.715309588860149 | -0.424 | -2.82 | 1.236 |
| -1.70902640355297 | -0.402 | -2.81 | 1.177 |
| -1.70274321824579 | -0.381 | -2.799 | 1.118 |
| -1.69646003293861 | -0.361 | -2.788 | 1.059 |
| -1.690176847631431 | -0.34 | -2.776 | 1.001 |
| -1.683893662324251 | -0.32 | -2.763 | 0.944 |
| -1.677610477017072 | -0.3 | -2.75 | 0.886 |
| -1.671327291709892 | -0.28 | -2.737 | 0.83 |
| -1.665044106402712 | -0.261 | -2.723 | 0.773 |
| -1.658760921095533 | -0.242 | -2.709 | 0.718 |
| -1.652477735788353 | -0.223 | -2.694 | 0.662 |
| -1.646194550481173 | -0.204 | -2.679 | 0.608 |
| -1.639911365173994 | -0.186 | -2.664 | 0.554 |
| -1.633628179866814 | -0.168 | -2.648 | 0.5 |
| -1.627344994559634 | -0.15 | -2.631 | 0.447 |
| -1.621061809252455 | -0.132 | -2.615 | 0.395 |
| -1.614778623945275 | -0.115 | -2.597 | 0.343 |
| -1.608495438638096 | -0.098 | -2.58 | 0.292 |
| -1.602212253330916 | -0.081 | -2.562 | 0.242 |
| -1.595929068023736 | -0.064 | -2.544 | 0.192 |
| -1.589645882716557 | -0.048 | -2.525 | 0.143 |
| -1.583362697409377 | -0.032 | -2.506 | 0.094 |
| -1.577079512102197 | -0.016 | -2.487 | 0.047 |
| -1.570796326795018 | 0 | -2.467 | 0 |
| -1.564513141487838 | 0.015 | -2.448 | -0.046 |
| -1.558229956180659 | 0.031 | -2.427 | -0.092 |
| -1.551946770873479 | 0.045 | -2.407 | -0.136 |
| -1.545663585566299 | 0.06 | -2.386 | -0.18 |
| -1.53938040025912 | 0.074 | -2.365 | -0.223 |
| -1.53309721495194 | 0.089 | -2.344 | -0.265 |
| -1.52681402964476 | 0.102 | -2.322 | -0.307 |
| -1.520530844337581 | 0.116 | -2.3 | -0.347 |
| -1.514247659030401 | 0.13 | -2.278 | -0.387 |
| -1.507964473723221 | 0.143 | -2.256 | -0.426 |
| -1.501681288416042 | 0.156 | -2.234 | -0.464 |
| -1.495398103108862 | 0.168 | -2.211 | -0.502 |
| -1.489114917801682 | 0.181 | -2.188 | -0.538 |
| -1.482831732494503 | 0.193 | -2.165 | -0.574 |
| -1.476548547187323 | 0.205 | -2.142 | -0.608 |
| -1.470265361880144 | 0.217 | -2.118 | -0.642 |
| -1.463982176572964 | 0.228 | -2.095 | -0.675 |
| -1.457698991265784 | 0.24 | -2.071 | -0.707 |
| -1.451415805958605 | 0.251 | -2.047 | -0.738 |
| -1.445132620651425 | 0.262 | -2.023 | -0.769 |
| -1.438849435344245 | 0.272 | -1.999 | -0.798 |
| -1.432566250037066 | 0.283 | -1.974 | -0.827 |
| -1.426283064729886 | 0.293 | -1.95 | -0.855 |
| -1.419999879422706 | 0.303 | -1.925 | -0.881 |
| -1.413716694115527 | 0.313 | -1.901 | -0.907 |
| -1.407433508808347 | 0.322 | -1.876 | -0.932 |
| -1.401150323501168 | 0.331 | -1.851 | -0.957 |
| -1.394867138193988 | 0.341 | -1.826 | -0.98 |
| -1.388583952886808 | 0.349 | -1.802 | -1.002 |
| -1.382300767579629 | 0.358 | -1.777 | -1.024 |
| -1.376017582272449 | 0.366 | -1.752 | -1.044 |
| -1.369734396965269 | 0.375 | -1.727 | -1.064 |
| -1.36345121165809 | 0.383 | -1.701 | -1.083 |
| -1.35716802635091 | 0.39 | -1.676 | -1.101 |
| -1.35088484104373 | 0.398 | -1.651 | -1.118 |
| -1.344601655736551 | 0.405 | -1.626 | -1.135 |
| -1.338318470429371 | 0.413 | -1.601 | -1.15 |
| -1.332035285122191 | 0.42 | -1.576 | -1.165 |
| -1.325752099815012 | 0.426 | -1.551 | -1.179 |
| -1.319468914507832 | 0.433 | -1.526 | -1.192 |
| -1.313185729200653 | 0.439 | -1.501 | -1.204 |
| -1.306902543893473 | 0.446 | -1.476 | -1.215 |
| -1.300619358586293 | 0.451 | -1.451 | -1.226 |
| -1.294336173279114 | 0.457 | -1.426 | -1.236 |
| -1.288052987971934 | 0.463 | -1.401 | -1.244 |
| -1.281769802664754 | 0.468 | -1.376 | -1.253 |
| -1.275486617357575 | 0.473 | -1.351 | -1.26 |
| -1.269203432050395 | 0.478 | -1.327 | -1.267 |
| -1.262920246743215 | 0.483 | -1.302 | -1.272 |
| -1.256637061436036 | 0.488 | -1.278 | -1.278 |
| -1.250353876128856 | 0.492 | -1.253 | -1.282 |
| -1.244070690821677 | 0.497 | -1.229 | -1.286 |
| -1.237787505514497 | 0.501 | -1.205 | -1.288 |
| -1.231504320207317 | 0.505 | -1.181 | -1.291 |
| -1.225221134900138 | 0.509 | -1.157 | -1.292 |
| -1.218937949592958 | 0.512 | -1.133 | -1.293 |
| -1.212654764285778 | 0.515 | -1.109 | -1.293 |
| -1.206371578978599 | 0.519 | -1.086 | -1.293 |
| -1.20008839367142 | 0.522 | -1.062 | -1.291 |
| -1.193805208364239 | 0.525 | -1.039 | -1.29 |
| -1.18752202305706 | 0.527 | -1.016 | -1.287 |
| -1.18123883774988 | 0.53 | -0.993 | -1.284 |
| -1.1749556524427 | 0.532 | -0.97 | -1.28 |
| -1.168672467135521 | 0.535 | -0.947 | -1.276 |
| -1.162389281828341 | 0.537 | -0.925 | -1.271 |
| -1.156106096521162 | 0.539 | -0.903 | -1.266 |
| -1.149822911213982 | 0.54 | -0.881 | -1.26 |
| -1.143539725906802 | 0.542 | -0.859 | -1.253 |
| -1.137256540599623 | 0.543 | -0.837 | -1.246 |
| -1.130973355292443 | 0.545 | -0.815 | -1.239 |
| -1.124690169985263 | 0.546 | -0.794 | -1.231 |
| -1.118406984678084 | 0.547 | -0.773 | -1.222 |
| -1.112123799370904 | 0.548 | -0.752 | -1.213 |
| -1.105840614063724 | 0.548 | -0.731 | -1.204 |
| -1.099557428756545 | 0.549 | -0.711 | -1.194 |
| -1.093274243449365 | 0.549 | -0.69 | -1.184 |
| -1.086991058142186 | 0.55 | -0.67 | -1.173 |
| -1.080707872835006 | 0.55 | -0.65 | -1.162 |
| -1.074424687527826 | 0.55 | -0.631 | -1.151 |
| -1.068141502220647 | 0.55 | -0.611 | -1.139 |
| -1.061858316913467 | 0.549 | -0.592 | -1.126 |
| -1.055575131606287 | 0.549 | -0.573 | -1.114 |
| -1.049291946299108 | 0.549 | -0.554 | -1.101 |
| -1.043008760991928 | 0.548 | -0.536 | -1.088 |
| -1.036725575684748 | 0.547 | -0.518 | -1.074 |
| -1.030442390377569 | 0.546 | -0.5 | -1.06 |
| -1.024159205070389 | 0.545 | -0.482 | -1.046 |
| -1.01787601976321 | 0.544 | -0.465 | -1.032 |
| -1.01159283445603 | 0.543 | -0.447 | -1.017 |
| -1.00530964914885 | 0.542 | -0.43 | -1.003 |
| -0.999026463841671 | 0.54 | -0.414 | -0.988 |
| -0.992743278534491 | 0.538 | -0.397 | -0.972 |
| -0.986460093227311 | 0.537 | -0.381 | -0.957 |
| -0.980176907920132 | 0.535 | -0.365 | -0.941 |
| -0.973893722612952 | 0.533 | -0.349 | -0.926 |
| -0.967610537305772 | 0.531 | -0.334 | -0.91 |
| -0.961327351998593 | 0.529 | -0.319 | -0.894 |
| -0.955044166691413 | 0.527 | -0.304 | -0.877 |
| -0.948760981384233 | 0.525 | -0.289 | -0.861 |
| -0.942477796077054 | 0.522 | -0.274 | -0.845 |
| -0.936194610769874 | 0.52 | -0.26 | -0.828 |
| -0.929911425462695 | 0.517 | -0.246 | -0.812 |
| -0.923628240155515 | 0.514 | -0.233 | -0.795 |
| -0.917345054848335 | 0.512 | -0.22 | -0.778 |
| -0.911061869541156 | 0.509 | -0.206 | -0.762 |
| -0.904778684233976 | 0.506 | -0.194 | -0.745 |
| -0.898495498926796 | 0.503 | -0.181 | -0.728 |
| -0.892212313619617 | 0.5 | -0.169 | -0.712 |
| -0.885929128312437 | 0.496 | -0.157 | -0.695 |
| -0.879645943005257 | 0.493 | -0.145 | -0.678 |
| -0.873362757698078 | 0.49 | -0.134 | -0.661 |
| -0.867079572390898 | 0.486 | -0.122 | -0.645 |
| -0.860796387083718 | 0.483 | -0.111 | -0.628 |
| -0.854513201776539 | 0.479 | -0.101 | -0.612 |
| -0.848230016469359 | 0.476 | -0.09 | -0.595 |
| -0.84194683116218 | 0.472 | -0.08 | -0.579 |
| -0.835663645855 | 0.468 | -0.07 | -0.562 |
| -0.82938046054782 | 0.465 | -0.06 | -0.546 |
| -0.823097275240641 | 0.461 | -0.051 | -0.53 |
| -0.816814089933461 | 0.457 | -0.042 | -0.514 |
| -0.810530904626281 | 0.453 | -0.033 | -0.498 |
| -0.804247719319102 | 0.449 | -0.024 | -0.482 |
| -0.797964534011922 | 0.445 | -0.016 | -0.467 |
| -0.791681348704742 | 0.44 | -0.008 | -0.451 |
| -0.785398163397563 | 0.436 | 0 | -0.436 |
| -0.779114978090383 | 0.432 | 0.008 | -0.421 |
| -0.772831792783204 | 0.428 | 0.015 | -0.406 |
| -0.766548607476024 | 0.423 | 0.022 | -0.391 |
| -0.760265422168844 | 0.419 | 0.029 | -0.377 |
| -0.753982236861665 | 0.414 | 0.036 | -0.362 |
| -0.747699051554485 | 0.41 | 0.042 | -0.348 |
| -0.741415866247305 | 0.405 | 0.048 | -0.334 |
| -0.735132680940126 | 0.401 | 0.054 | -0.32 |
| -0.728849495632946 | 0.396 | 0.06 | -0.307 |
| -0.722566310325766 | 0.392 | 0.065 | -0.293 |
| -0.716283125018587 | 0.387 | 0.071 | -0.28 |
| -0.709999939711407 | 0.382 | 0.076 | -0.267 |
| -0.703716754404227 | 0.378 | 0.081 | -0.255 |
| -0.697433569097048 | 0.373 | 0.085 | -0.242 |
| -0.691150383789868 | 0.368 | 0.09 | -0.23 |
| -0.684867198482689 | 0.363 | 0.094 | -0.218 |
| -0.678584013175509 | 0.358 | 0.098 | -0.206 |
| -0.672300827868329 | 0.354 | 0.101 | -0.195 |
| -0.66601764256115 | 0.349 | 0.105 | -0.184 |
| -0.65973445725397 | 0.344 | 0.108 | -0.173 |
| -0.65345127194679 | 0.339 | 0.111 | -0.162 |
| -0.647168086639611 | 0.334 | 0.114 | -0.152 |
| -0.640884901332431 | 0.329 | 0.117 | -0.142 |
| -0.634601716025251 | 0.324 | 0.12 | -0.132 |
| -0.628318530718072 | 0.319 | 0.122 | -0.122 |
| -0.622035345410892 | 0.314 | 0.124 | -0.113 |
| -0.615752160103712 | 0.31 | 0.126 | -0.103 |
| -0.609468974796533 | 0.305 | 0.128 | -0.095 |
| -0.603185789489353 | 0.3 | 0.13 | -0.086 |
| -0.596902604182174 | 0.295 | 0.131 | -0.078 |
| -0.590619418874994 | 0.29 | 0.132 | -0.07 |
| -0.584336233567814 | 0.285 | 0.134 | -0.062 |
| -0.578053048260635 | 0.28 | 0.135 | -0.054 |
| -0.571769862953455 | 0.275 | 0.135 | -0.047 |
| -0.565486677646275 | 0.27 | 0.136 | -0.04 |
| -0.559203492339096 | 0.265 | 0.137 | -0.033 |
| -0.552920307031916 | 0.26 | 0.137 | -0.027 |
| -0.546637121724737 | 0.255 | 0.137 | -0.021 |
| -0.540353936417557 | 0.25 | 0.137 | -0.015 |
| -0.534070751110377 | 0.246 | 0.137 | -0.009 |
| -0.527787565803198 | 0.241 | 0.137 | -0.004 |
| -0.521504380496018 | 0.236 | 0.137 | 0.002 |
| -0.515221195188838 | 0.231 | 0.137 | 0.007 |
| -0.508938009881659 | 0.226 | 0.136 | 0.011 |
| -0.502654824574479 | 0.221 | 0.135 | 0.016 |
| -0.496371639267299 | 0.217 | 0.135 | 0.02 |
| -0.49008845396012 | 0.212 | 0.134 | 0.024 |
| -0.48380526865294 | 0.207 | 0.133 | 0.028 |
| -0.477522083345761 | 0.203 | 0.132 | 0.031 |
| -0.471238898038581 | 0.198 | 0.131 | 0.035 |
| -0.464955712731402 | 0.193 | 0.129 | 0.038 |
| -0.458672527424222 | 0.189 | 0.128 | 0.041 |
| -0.452389342117042 | 0.184 | 0.126 | 0.043 |
| -0.446106156809863 | 0.18 | 0.125 | 0.046 |
| -0.439822971502683 | 0.175 | 0.123 | 0.048 |
| -0.433539786195504 | 0.171 | 0.122 | 0.05 |
| -0.427256600888324 | 0.166 | 0.12 | 0.052 |
| -0.420973415581144 | 0.162 | 0.118 | 0.054 |
| -0.414690230273965 | 0.157 | 0.116 | 0.055 |
| -0.408407044966785 | 0.153 | 0.114 | 0.057 |
| -0.402123859659606 | 0.149 | 0.112 | 0.058 |
| -0.395840674352426 | 0.145 | 0.11 | 0.059 |
| -0.389557489045247 | 0.14 | 0.108 | 0.059 |
| -0.383274303738067 | 0.136 | 0.106 | 0.06 |
| -0.376991118430887 | 0.132 | 0.104 | 0.061 |
| -0.370707933123708 | 0.128 | 0.101 | 0.061 |
| -0.364424747816528 | 0.124 | 0.099 | 0.061 |
| -0.358141562509349 | 0.12 | 0.097 | 0.061 |
| -0.351858377202169 | 0.116 | 0.094 | 0.061 |
| -0.345575191894989 | 0.112 | 0.092 | 0.061 |
| -0.33929200658781 | 0.109 | 0.09 | 0.06 |
| -0.33300882128063 | 0.105 | 0.087 | 0.06 |
| -0.326725635973451 | 0.101 | 0.085 | 0.059 |
| -0.320442450666271 | 0.097 | 0.082 | 0.059 |
| -0.314159265359092 | 0.094 | 0.08 | 0.058 |
| -0.307876080051912 | 0.09 | 0.077 | 0.057 |
| -0.301592894744732 | 0.087 | 0.075 | 0.056 |
| -0.295309709437553 | 0.083 | 0.072 | 0.055 |
| -0.289026524130373 | 0.08 | 0.07 | 0.054 |
| -0.282743338823194 | 0.077 | 0.067 | 0.053 |
| -0.276460153516014 | 0.074 | 0.065 | 0.052 |
| -0.270176968208834 | 0.07 | 0.063 | 0.05 |
| -0.263893782901655 | 0.067 | 0.06 | 0.049 |
| -0.257610597594475 | 0.064 | 0.058 | 0.048 |
| -0.251327412287296 | 0.061 | 0.055 | 0.046 |
| -0.245044226980116 | 0.058 | 0.053 | 0.045 |
| -0.238761041672937 | 0.055 | 0.051 | 0.043 |
| -0.232477856365757 | 0.053 | 0.048 | 0.041 |
| -0.226194671058577 | 0.05 | 0.046 | 0.04 |
| -0.219911485751398 | 0.047 | 0.044 | 0.038 |
| -0.213628300444218 | 0.045 | 0.042 | 0.037 |
| -0.207345115137039 | 0.042 | 0.039 | 0.035 |
| -0.201061929829859 | 0.04 | 0.037 | 0.033 |
| -0.194778744522679 | 0.037 | 0.035 | 0.032 |
| -0.1884955592155 | 0.035 | 0.033 | 0.03 |
| -0.18221237390832 | 0.033 | 0.031 | 0.028 |
| -0.175929188601141 | 0.03 | 0.029 | 0.027 |
| -0.169646003293961 | 0.028 | 0.027 | 0.025 |
| -0.163362817986782 | 0.026 | 0.025 | 0.024 |
| -0.157079632679602 | 0.024 | 0.023 | 0.022 |
| -0.150796447372422 | 0.022 | 0.022 | 0.02 |
| -0.144513262065243 | 0.021 | 0.02 | 0.019 |
| -0.138230076758063 | 0.019 | 0.018 | 0.017 |
| -0.131946891450884 | 0.017 | 0.017 | 0.016 |
| -0.125663706143704 | 0.016 | 0.015 | 0.015 |
| -0.119380520836524 | 0.014 | 0.014 | 0.013 |
| -0.113097335529345 | 0.013 | 0.012 | 0.012 |
| -0.106814150222165 | 0.011 | 0.011 | 0.011 |
| -0.100530964914986 | 0.01 | 0.01 | 0.01 |
| -0.0942477796078061 | 0.009 | 0.009 | 0.009 |
| -0.0879645943006265 | 0.008 | 0.008 | 0.007 |
| -0.0816814089934469 | 0.007 | 0.007 | 0.006 |
| -0.0753982236862674 | 0.006 | 0.006 | 0.006 |
| -0.0691150383790878 | 0.005 | 0.005 | 0.005 |
| -0.0628318530719082 | 0.004 | 0.004 | 0.004 |
| -0.0565486677647286 | 0.003 | 0.003 | 0.003 |
| -0.050265482457549 | 0.003 | 0.003 | 0.002 |
| -0.0439822971503694 | 0.002 | 0.002 | 0.002 |
| -0.0376991118431899 | 0.001 | 0.001 | 0.001 |
| -0.0314159265360103 | 0.001 | 0.001 | 0.001 |
| -0.0251327412288307 | 0.001 | 0.001 | 0.001 |
| -0.0188495559216511 | 0 | 0 | 0 |
| -0.0125663706144715 | 0 | 0 | 0 |
| -0.00628318530729192 | 0 | 0 | 0 |
| -1.12338957580782e-13 | 0 | 0 | 0 |
| 0.00628318530706725 | 0 | 0 | 0 |
| 0.0125663706142468 | 0 | 0 | 0 |
| 0.0188495559214264 | 0 | 0 | 0 |
| 0.025132741228606 | 0.001 | 0.001 | 0.001 |
| 0.0314159265357856 | 0.001 | 0.001 | 0.001 |
| 0.0376991118429652 | 0.001 | 0.001 | 0.001 |
| 0.0439822971501448 | 0.002 | 0.002 | 0.002 |
| 0.0502654824573243 | 0.003 | 0.003 | 0.002 |
| 0.0565486677645039 | 0.003 | 0.003 | 0.003 |
| 0.0628318530716835 | 0.004 | 0.004 | 0.004 |
| 0.0691150383788631 | 0.005 | 0.005 | 0.005 |
| 0.0753982236860427 | 0.006 | 0.006 | 0.006 |
| 0.0816814089932222 | 0.007 | 0.007 | 0.006 |
| 0.0879645943004018 | 0.008 | 0.008 | 0.007 |
| 0.0942477796075814 | 0.009 | 0.009 | 0.009 |
| 0.100530964914761 | 0.01 | 0.01 | 0.01 |
| 0.106814150221941 | 0.011 | 0.011 | 0.011 |
| 0.11309733552912 | 0.013 | 0.012 | 0.012 |
| 0.1193805208363 | 0.014 | 0.014 | 0.013 |
| 0.125663706143479 | 0.016 | 0.015 | 0.015 |
| 0.131946891450659 | 0.017 | 0.017 | 0.016 |
| 0.138230076757839 | 0.019 | 0.018 | 0.017 |
| 0.144513262065018 | 0.021 | 0.02 | 0.019 |
| 0.150796447372198 | 0.022 | 0.022 | 0.02 |
| 0.157079632679377 | 0.024 | 0.023 | 0.022 |
| 0.163362817986557 | 0.026 | 0.025 | 0.024 |
| 0.169646003293736 | 0.028 | 0.027 | 0.025 |
| 0.175929188600916 | 0.03 | 0.029 | 0.027 |
| 0.182212373908096 | 0.033 | 0.031 | 0.028 |
| 0.188495559215275 | 0.035 | 0.033 | 0.03 |
| 0.194778744522455 | 0.037 | 0.035 | 0.032 |
| 0.201061929829634 | 0.04 | 0.037 | 0.033 |
| 0.207345115136814 | 0.042 | 0.039 | 0.035 |
| 0.213628300443994 | 0.045 | 0.042 | 0.037 |
| 0.219911485751173 | 0.047 | 0.044 | 0.038 |
| 0.226194671058353 | 0.05 | 0.046 | 0.04 |
| 0.232477856365532 | 0.053 | 0.048 | 0.041 |
| 0.238761041672712 | 0.055 | 0.051 | 0.043 |
| 0.245044226979891 | 0.058 | 0.053 | 0.045 |
| 0.251327412287071 | 0.061 | 0.055 | 0.046 |
| 0.257610597594251 | 0.064 | 0.058 | 0.048 |
| 0.26389378290143 | 0.067 | 0.06 | 0.049 |
| 0.27017696820861 | 0.07 | 0.063 | 0.05 |
| 0.276460153515789 | 0.074 | 0.065 | 0.052 |
| 0.282743338822969 | 0.077 | 0.067 | 0.053 |
| 0.289026524130149 | 0.08 | 0.07 | 0.054 |
| 0.295309709437328 | 0.083 | 0.072 | 0.055 |
| 0.301592894744508 | 0.087 | 0.075 | 0.056 |
| 0.307876080051687 | 0.09 | 0.077 | 0.057 |
| 0.314159265358867 | 0.094 | 0.08 | 0.058 |
| 0.320442450666046 | 0.097 | 0.082 | 0.059 |
| 0.326725635973226 | 0.101 | 0.085 | 0.059 |
| 0.333008821280406 | 0.105 | 0.087 | 0.06 |
| 0.339292006587585 | 0.109 | 0.09 | 0.06 |
| 0.345575191894765 | 0.112 | 0.092 | 0.061 |
| 0.351858377201944 | 0.116 | 0.094 | 0.061 |
| 0.358141562509124 | 0.12 | 0.097 | 0.061 |
| 0.364424747816304 | 0.124 | 0.099 | 0.061 |
| 0.370707933123483 | 0.128 | 0.101 | 0.061 |
| 0.376991118430663 | 0.132 | 0.104 | 0.061 |
| 0.383274303737842 | 0.136 | 0.106 | 0.06 |
| 0.389557489045022 | 0.14 | 0.108 | 0.059 |
| 0.395840674352201 | 0.145 | 0.11 | 0.059 |
| 0.402123859659381 | 0.149 | 0.112 | 0.058 |
| 0.408407044966561 | 0.153 | 0.114 | 0.057 |
| 0.41469023027374 | 0.157 | 0.116 | 0.055 |
| 0.42097341558092 | 0.162 | 0.118 | 0.054 |
| 0.427256600888099 | 0.166 | 0.12 | 0.052 |
| 0.433539786195279 | 0.171 | 0.122 | 0.05 |
| 0.439822971502459 | 0.175 | 0.123 | 0.048 |
| 0.446106156809638 | 0.18 | 0.125 | 0.046 |
| 0.452389342116818 | 0.184 | 0.126 | 0.043 |
| 0.458672527423997 | 0.189 | 0.128 | 0.041 |
| 0.464955712731177 | 0.193 | 0.129 | 0.038 |
| 0.471238898038356 | 0.198 | 0.131 | 0.035 |
| 0.477522083345536 | 0.203 | 0.132 | 0.031 |
| 0.483805268652716 | 0.207 | 0.133 | 0.028 |
| 0.490088453959895 | 0.212 | 0.134 | 0.024 |
| 0.496371639267075 | 0.217 | 0.135 | 0.02 |
| 0.502654824574254 | 0.221 | 0.135 | 0.016 |
| 0.508938009881434 | 0.226 | 0.136 | 0.011 |
| 0.515221195188614 | 0.231 | 0.137 | 0.007 |
| 0.521504380495793 | 0.236 | 0.137 | 0.002 |
| 0.527787565802973 | 0.241 | 0.137 | -0.004 |
| 0.534070751110153 | 0.246 | 0.137 | -0.009 |
| 0.540353936417332 | 0.25 | 0.137 | -0.015 |
| 0.546637121724512 | 0.255 | 0.137 | -0.021 |
| 0.552920307031692 | 0.26 | 0.137 | -0.027 |
| 0.559203492338871 | 0.265 | 0.137 | -0.033 |
| 0.565486677646051 | 0.27 | 0.136 | -0.04 |
| 0.571769862953231 | 0.275 | 0.135 | -0.047 |
| 0.57805304826041 | 0.28 | 0.135 | -0.054 |
| 0.58433623356759 | 0.285 | 0.134 | -0.062 |
| 0.590619418874769 | 0.29 | 0.132 | -0.07 |
| 0.596902604181949 | 0.295 | 0.131 | -0.078 |
| 0.603185789489129 | 0.3 | 0.13 | -0.086 |
| 0.609468974796308 | 0.305 | 0.128 | -0.095 |
| 0.615752160103488 | 0.31 | 0.126 | -0.103 |
| 0.622035345410668 | 0.314 | 0.124 | -0.113 |
| 0.628318530717847 | 0.319 | 0.122 | -0.122 |
| 0.634601716025027 | 0.324 | 0.12 | -0.132 |
| 0.640884901332206 | 0.329 | 0.117 | -0.142 |
| 0.647168086639386 | 0.334 | 0.114 | -0.152 |
| 0.653451271946566 | 0.339 | 0.111 | -0.162 |
| 0.659734457253745 | 0.344 | 0.108 | -0.173 |
| 0.666017642560925 | 0.349 | 0.105 | -0.184 |
| 0.672300827868105 | 0.354 | 0.101 | -0.195 |
| 0.678584013175284 | 0.358 | 0.098 | -0.206 |
| 0.684867198482464 | 0.363 | 0.094 | -0.218 |
| 0.691150383789644 | 0.368 | 0.09 | -0.23 |
| 0.697433569096823 | 0.373 | 0.085 | -0.242 |
| 0.703716754404003 | 0.378 | 0.081 | -0.255 |
| 0.709999939711183 | 0.382 | 0.076 | -0.267 |
| 0.716283125018362 | 0.387 | 0.071 | -0.28 |
| 0.722566310325542 | 0.392 | 0.065 | -0.293 |
| 0.728849495632721 | 0.396 | 0.06 | -0.307 |
| 0.735132680939901 | 0.401 | 0.054 | -0.32 |
| 0.741415866247081 | 0.405 | 0.048 | -0.334 |
| 0.74769905155426 | 0.41 | 0.042 | -0.348 |
| 0.75398223686144 | 0.414 | 0.036 | -0.362 |
| 0.76026542216862 | 0.419 | 0.029 | -0.377 |
| 0.766548607475799 | 0.423 | 0.022 | -0.391 |
| 0.772831792782979 | 0.428 | 0.015 | -0.406 |
| 0.779114978090159 | 0.432 | 0.008 | -0.421 |
| 0.785398163397338 | 0.436 | 0 | -0.436 |
| 0.791681348704518 | 0.44 | -0.008 | -0.451 |
| 0.797964534011697 | 0.445 | -0.016 | -0.467 |
| 0.804247719318877 | 0.449 | -0.024 | -0.482 |
| 0.810530904626057 | 0.453 | -0.033 | -0.498 |
| 0.816814089933236 | 0.457 | -0.042 | -0.514 |
| 0.823097275240416 | 0.461 | -0.051 | -0.53 |
| 0.829380460547596 | 0.465 | -0.06 | -0.546 |
| 0.835663645854775 | 0.468 | -0.07 | -0.562 |
| 0.841946831161955 | 0.472 | -0.08 | -0.579 |
| 0.848230016469135 | 0.476 | -0.09 | -0.595 |
| 0.854513201776314 | 0.479 | -0.101 | -0.612 |
| 0.860796387083494 | 0.483 | -0.111 | -0.628 |
| 0.867079572390674 | 0.486 | -0.122 | -0.645 |
| 0.873362757697853 | 0.49 | -0.134 | -0.661 |
| 0.879645943005033 | 0.493 | -0.145 | -0.678 |
| 0.885929128312212 | 0.496 | -0.157 | -0.695 |
| 0.892212313619392 | 0.5 | -0.169 | -0.712 |
| 0.898495498926572 | 0.503 | -0.181 | -0.728 |
| 0.904778684233751 | 0.506 | -0.194 | -0.745 |
| 0.911061869540931 | 0.509 | -0.206 | -0.762 |
| 0.917345054848111 | 0.512 | -0.22 | -0.778 |
| 0.92362824015529 | 0.514 | -0.233 | -0.795 |
| 0.92991142546247 | 0.517 | -0.246 | -0.812 |
| 0.93619461076965 | 0.52 | -0.26 | -0.828 |
| 0.942477796076829 | 0.522 | -0.274 | -0.845 |
| 0.948760981384009 | 0.525 | -0.289 | -0.861 |
| 0.955044166691188 | 0.527 | -0.304 | -0.877 |
| 0.961327351998368 | 0.529 | -0.319 | -0.894 |
| 0.967610537305548 | 0.531 | -0.334 | -0.91 |
| 0.973893722612727 | 0.533 | -0.349 | -0.926 |
| 0.980176907919907 | 0.535 | -0.365 | -0.941 |
| 0.986460093227087 | 0.537 | -0.381 | -0.957 |
| 0.992743278534266 | 0.538 | -0.397 | -0.972 |
| 0.999026463841446 | 0.54 | -0.414 | -0.988 |
| 1.005309649148626 | 0.542 | -0.43 | -1.003 |
| 1.011592834455805 | 0.543 | -0.447 | -1.017 |
| 1.017876019762985 | 0.544 | -0.465 | -1.032 |
| 1.024159205070164 | 0.545 | -0.482 | -1.046 |
| 1.030442390377344 | 0.546 | -0.5 | -1.06 |
| 1.036725575684524 | 0.547 | -0.518 | -1.074 |
| 1.043008760991703 | 0.548 | -0.536 | -1.088 |
| 1.049291946298883 | 0.549 | -0.554 | -1.101 |
| 1.055575131606063 | 0.549 | -0.573 | -1.114 |
| 1.061858316913242 | 0.549 | -0.592 | -1.126 |
| 1.068141502220422 | 0.55 | -0.611 | -1.139 |
| 1.074424687527602 | 0.55 | -0.631 | -1.151 |
| 1.080707872834781 | 0.55 | -0.65 | -1.162 |
| 1.086991058141961 | 0.55 | -0.67 | -1.173 |
| 1.09327424344914 | 0.549 | -0.69 | -1.184 |
| 1.09955742875632 | 0.549 | -0.711 | -1.194 |
| 1.1058406140635 | 0.548 | -0.731 | -1.204 |
| 1.112123799370679 | 0.548 | -0.752 | -1.213 |
| 1.11840698467786 | 0.547 | -0.773 | -1.222 |
| 1.124690169985039 | 0.546 | -0.794 | -1.231 |
| 1.130973355292218 | 0.545 | -0.815 | -1.239 |
| 1.137256540599398 | 0.543 | -0.837 | -1.246 |
| 1.143539725906578 | 0.542 | -0.859 | -1.253 |
| 1.149822911213757 | 0.54 | -0.881 | -1.26 |
| 1.156106096520937 | 0.539 | -0.903 | -1.266 |
| 1.162389281828116 | 0.537 | -0.925 | -1.271 |
| 1.168672467135296 | 0.535 | -0.947 | -1.276 |
| 1.174955652442476 | 0.532 | -0.97 | -1.28 |
| 1.181238837749655 | 0.53 | -0.993 | -1.284 |
| 1.187522023056835 | 0.527 | -1.016 | -1.287 |
| 1.193805208364015 | 0.525 | -1.039 | -1.29 |
| 1.200088393671194 | 0.522 | -1.062 | -1.291 |
| 1.206371578978374 | 0.519 | -1.086 | -1.293 |
| 1.212654764285554 | 0.515 | -1.109 | -1.293 |
| 1.218937949592733 | 0.512 | -1.133 | -1.293 |
| 1.225221134899913 | 0.509 | -1.157 | -1.292 |
| 1.231504320207093 | 0.505 | -1.181 | -1.291 |
| 1.237787505514272 | 0.501 | -1.205 | -1.288 |
| 1.244070690821452 | 0.497 | -1.229 | -1.286 |
| 1.250353876128631 | 0.492 | -1.253 | -1.282 |
| 1.256637061435811 | 0.488 | -1.278 | -1.278 |
| 1.262920246742991 | 0.483 | -1.302 | -1.272 |
| 1.26920343205017 | 0.478 | -1.327 | -1.267 |
| 1.27548661735735 | 0.473 | -1.351 | -1.26 |
| 1.28176980266453 | 0.468 | -1.376 | -1.253 |
| 1.28805298797171 | 0.463 | -1.401 | -1.244 |
| 1.294336173278889 | 0.457 | -1.426 | -1.236 |
| 1.300619358586069 | 0.451 | -1.451 | -1.226 |
| 1.306902543893248 | 0.446 | -1.476 | -1.215 |
| 1.313185729200428 | 0.439 | -1.501 | -1.204 |
| 1.319468914507607 | 0.433 | -1.526 | -1.192 |
| 1.325752099814787 | 0.426 | -1.551 | -1.179 |
| 1.332035285121967 | 0.42 | -1.576 | -1.165 |
| 1.338318470429146 | 0.413 | -1.601 | -1.15 |
| 1.344601655736326 | 0.405 | -1.626 | -1.135 |
| 1.350884841043506 | 0.398 | -1.651 | -1.118 |
| 1.357168026350685 | 0.39 | -1.676 | -1.101 |
| 1.363451211657865 | 0.383 | -1.701 | -1.083 |
| 1.369734396965045 | 0.375 | -1.727 | -1.064 |
| 1.376017582272224 | 0.366 | -1.752 | -1.044 |
| 1.382300767579404 | 0.358 | -1.777 | -1.024 |
| 1.388583952886583 | 0.349 | -1.802 | -1.002 |
| 1.394867138193763 | 0.341 | -1.826 | -0.98 |
| 1.401150323500943 | 0.331 | -1.851 | -0.957 |
| 1.407433508808122 | 0.322 | -1.876 | -0.932 |
| 1.413716694115302 | 0.313 | -1.901 | -0.907 |
| 1.419999879422482 | 0.303 | -1.925 | -0.881 |
| 1.426283064729661 | 0.293 | -1.95 | -0.855 |
| 1.432566250036841 | 0.283 | -1.974 | -0.827 |
| 1.438849435344021 | 0.272 | -1.999 | -0.798 |
| 1.4451326206512 | 0.262 | -2.023 | -0.769 |
| 1.45141580595838 | 0.251 | -2.047 | -0.738 |
| 1.45769899126556 | 0.24 | -2.071 | -0.707 |
| 1.46398217657274 | 0.228 | -2.095 | -0.675 |
| 1.470265361879919 | 0.217 | -2.118 | -0.642 |
| 1.476548547187098 | 0.205 | -2.142 | -0.608 |
| 1.482831732494278 | 0.193 | -2.165 | -0.574 |
| 1.489114917801458 | 0.181 | -2.188 | -0.538 |
| 1.495398103108637 | 0.168 | -2.211 | -0.502 |
| 1.501681288415817 | 0.156 | -2.234 | -0.464 |
| 1.507964473722997 | 0.143 | -2.256 | -0.426 |
| 1.514247659030176 | 0.13 | -2.278 | -0.387 |
| 1.520530844337356 | 0.116 | -2.3 | -0.347 |
| 1.526814029644536 | 0.102 | -2.322 | -0.307 |
| 1.533097214951715 | 0.089 | -2.344 | -0.265 |
| 1.539380400258895 | 0.074 | -2.365 | -0.223 |
| 1.545663585566075 | 0.06 | -2.386 | -0.18 |
| 1.551946770873254 | 0.045 | -2.407 | -0.136 |
| 1.558229956180434 | 0.031 | -2.427 | -0.092 |
| 1.564513141487613 | 0.015 | -2.448 | -0.046 |
| 1.570796326794793 | 0 | -2.467 | 0 |
| 1.577079512101973 | -0.016 | -2.487 | 0.047 |
| 1.583362697409152 | -0.032 | -2.506 | 0.094 |
| 1.589645882716332 | -0.048 | -2.525 | 0.143 |
| 1.595929068023512 | -0.064 | -2.544 | 0.192 |
| 1.602212253330691 | -0.081 | -2.562 | 0.242 |
| 1.608495438637871 | -0.098 | -2.58 | 0.292 |
| 1.61477862394505 | -0.115 | -2.597 | 0.343 |
| 1.62106180925223 | -0.132 | -2.615 | 0.395 |
| 1.62734499455941 | -0.15 | -2.631 | 0.447 |
| 1.633628179866589 | -0.168 | -2.648 | 0.5 |
| 1.63991136517377 | -0.186 | -2.664 | 0.554 |
| 1.646194550480949 | -0.204 | -2.679 | 0.608 |
| 1.652477735788128 | -0.223 | -2.694 | 0.662 |
| 1.658760921095308 | -0.242 | -2.709 | 0.718 |
| 1.665044106402488 | -0.261 | -2.723 | 0.773 |
| 1.671327291709667 | -0.28 | -2.737 | 0.83 |
| 1.677610477016847 | -0.3 | -2.75 | 0.886 |
| 1.683893662324026 | -0.32 | -2.763 | 0.944 |
| 1.690176847631206 | -0.34 | -2.776 | 1.001 |
| 1.696460032938386 | -0.361 | -2.788 | 1.059 |
| 1.702743218245565 | -0.381 | -2.799 | 1.118 |
| 1.709026403552745 | -0.402 | -2.81 | 1.177 |
| 1.715309588859925 | -0.424 | -2.82 | 1.236 |
| 1.721592774167104 | -0.445 | -2.83 | 1.296 |
| 1.727875959474284 | -0.467 | -2.839 | 1.355 |
| 1.734159144781464 | -0.489 | -2.848 | 1.416 |
| 1.740442330088643 | -0.511 | -2.856 | 1.476 |
| 1.746725515395823 | -0.534 | -2.864 | 1.537 |
| 1.753008700703003 | -0.557 | -2.871 | 1.597 |
| 1.759291886010182 | -0.58 | -2.878 | 1.658 |
| 1.765575071317362 | -0.603 | -2.884 | 1.72 |
| 1.771858256624541 | -0.627 | -2.889 | 1.781 |
| 1.778141441931721 | -0.651 | -2.894 | 1.842 |
| 1.784424627238901 | -0.675 | -2.898 | 1.904 |
| 1.79070781254608 | -0.7 | -2.901 | 1.965 |
| 1.79699099785326 | -0.724 | -2.904 | 2.027 |
| 1.80327418316044 | -0.749 | -2.907 | 2.088 |
| 1.809557368467619 | -0.774 | -2.908 | 2.15 |
| 1.815840553774799 | -0.8 | -2.909 | 2.211 |
| 1.822123739081979 | -0.826 | -2.909 | 2.273 |
| 1.828406924389158 | -0.852 | -2.909 | 2.334 |
| 1.834690109696338 | -0.878 | -2.908 | 2.395 |
| 1.840973295003518 | -0.905 | -2.906 | 2.456 |
| 1.847256480310697 | -0.931 | -2.904 | 2.517 |
| 1.853539665617877 | -0.959 | -2.901 | 2.577 |
| 1.859822850925056 | -0.986 | -2.897 | 2.637 |
| 1.866106036232236 | -1.013 | -2.892 | 2.697 |
| 1.872389221539416 | -1.041 | -2.887 | 2.757 |
| 1.878672406846595 | -1.07 | -2.881 | 2.816 |
| 1.884955592153775 | -1.098 | -2.874 | 2.874 |
| 1.891238777460955 | -1.127 | -2.867 | 2.933 |
| 1.897521962768134 | -1.156 | -2.859 | 2.991 |
| 1.903805148075314 | -1.185 | -2.85 | 3.048 |
| 1.910088333382494 | -1.214 | -2.84 | 3.105 |
| 1.916371518689673 | -1.244 | -2.83 | 3.161 |
| 1.922654703996853 | -1.274 | -2.818 | 3.217 |
| 1.928937889304033 | -1.304 | -2.806 | 3.272 |
| 1.935221074611212 | -1.335 | -2.794 | 3.326 |
| 1.941504259918392 | -1.366 | -2.78 | 3.38 |
| 1.947787445225571 | -1.397 | -2.766 | 3.433 |
| 1.954070630532751 | -1.428 | -2.75 | 3.485 |
| 1.960353815839931 | -1.459 | -2.734 | 3.536 |
| 1.96663700114711 | -1.491 | -2.718 | 3.587 |
| 1.97292018645429 | -1.523 | -2.7 | 3.637 |
| 1.97920337176147 | -1.556 | -2.682 | 3.686 |
| 1.985486557068649 | -1.588 | -2.662 | 3.734 |
| 1.991769742375829 | -1.621 | -2.642 | 3.781 |
| 1.998052927683009 | -1.654 | -2.621 | 3.827 |
| 2.004336112990188 | -1.688 | -2.599 | 3.872 |
| 2.010619298297368 | -1.721 | -2.577 | 3.916 |
| 2.016902483604547 | -1.755 | -2.553 | 3.958 |
| 2.023185668911727 | -1.789 | -2.529 | 4 |
| 2.029468854218907 | -1.824 | -2.504 | 4.041 |
| 2.035752039526086 | -1.858 | -2.478 | 4.08 |
| 2.042035224833266 | -1.893 | -2.451 | 4.119 |
| 2.048318410140446 | -1.928 | -2.423 | 4.156 |
| 2.054601595447625 | -1.964 | -2.395 | 4.191 |
| 2.060884780754805 | -1.999 | -2.365 | 4.226 |
| 2.067167966061984 | -2.035 | -2.335 | 4.259 |
| 2.073451151369164 | -2.071 | -2.304 | 4.291 |
| 2.079734336676344 | -2.108 | -2.272 | 4.321 |
| 2.086017521983524 | -2.144 | -2.239 | 4.35 |
| 2.092300707290703 | -2.181 | -2.205 | 4.378 |
| 2.098583892597883 | -2.218 | -2.17 | 4.404 |
| 2.104867077905062 | -2.255 | -2.134 | 4.428 |
| 2.111150263212242 | -2.293 | -2.098 | 4.451 |
| 2.117433448519422 | -2.331 | -2.061 | 4.473 |
| 2.123716633826601 | -2.369 | -2.022 | 4.493 |
| 2.129999819133781 | -2.407 | -1.983 | 4.511 |
| 2.136283004440961 | -2.445 | -1.943 | 4.528 |
| 2.14256618974814 | -2.484 | -1.902 | 4.543 |
| 2.14884937505532 | -2.523 | -1.86 | 4.556 |
| 2.1551325603625 | -2.562 | -1.818 | 4.568 |
| 2.16141574566968 | -2.602 | -1.774 | 4.578 |
| 2.167698930976859 | -2.641 | -1.73 | 4.586 |
| 2.173982116284038 | -2.681 | -1.684 | 4.592 |
| 2.180265301591218 | -2.721 | -1.638 | 4.597 |
| 2.186548486898398 | -2.761 | -1.591 | 4.599 |
| 2.192831672205577 | -2.802 | -1.543 | 4.6 |
| 2.199114857512757 | -2.843 | -1.494 | 4.599 |
| 2.205398042819936 | -2.884 | -1.445 | 4.597 |
| 2.211681228127116 | -2.925 | -1.394 | 4.592 |
| 2.217964413434296 | -2.966 | -1.343 | 4.585 |
| 2.224247598741475 | -3.008 | -1.29 | 4.577 |
| 2.230530784048655 | -3.049 | -1.237 | 4.566 |
| 2.236813969355835 | -3.091 | -1.183 | 4.554 |
| 2.243097154663014 | -3.134 | -1.128 | 4.539 |
| 2.249380339970194 | -3.176 | -1.073 | 4.523 |
| 2.255663525277374 | -3.219 | -1.016 | 4.504 |
| 2.261946710584553 | -3.261 | -0.959 | 4.484 |
| 2.268229895891733 | -3.304 | -0.9 | 4.461 |
| 2.274513081198912 | -3.347 | -0.841 | 4.436 |
| 2.280796266506092 | -3.391 | -0.781 | 4.41 |
| 2.287079451813272 | -3.434 | -0.721 | 4.381 |
| 2.293362637120452 | -3.478 | -0.659 | 4.35 |
| 2.299645822427631 | -3.522 | -0.597 | 4.317 |
| 2.305929007734811 | -3.566 | -0.534 | 4.282 |
| 2.312212193041991 | -3.611 | -0.47 | 4.245 |
| 2.31849537834917 | -3.655 | -0.405 | 4.206 |
| 2.32477856365635 | -3.7 | -0.339 | 4.164 |
| 2.331061748963529 | -3.745 | -0.273 | 4.121 |
| 2.337344934270709 | -3.79 | -0.206 | 4.075 |
| 2.343628119577889 | -3.835 | -0.138 | 4.027 |
| 2.349911304885068 | -3.88 | -0.069 | 3.978 |
| 2.356194490192248 | -3.926 | 0 | 3.926 |
| 2.362477675499428 | -3.971 | 0.07 | 3.871 |
| 2.368760860806607 | -4.017 | 0.141 | 3.815 |
| 2.375044046113787 | -4.063 | 0.213 | 3.757 |
| 2.381327231420966 | -4.109 | 0.285 | 3.696 |
| 2.387610416728146 | -4.156 | 0.358 | 3.634 |
| 2.393893602035326 | -4.202 | 0.432 | 3.569 |
| 2.400176787342505 | -4.249 | 0.506 | 3.502 |
| 2.406459972649685 | -4.295 | 0.581 | 3.433 |
| 2.412743157956865 | -4.342 | 0.657 | 3.362 |
| 2.419026343264044 | -4.389 | 0.733 | 3.289 |
| 2.425309528571224 | -4.437 | 0.81 | 3.214 |
| 2.431592713878404 | -4.484 | 0.888 | 3.137 |
| 2.437875899185583 | -4.531 | 0.967 | 3.057 |
| 2.444159084492763 | -4.579 | 1.046 | 2.976 |
| 2.450442269799943 | -4.627 | 1.125 | 2.893 |
| 2.456725455107122 | -4.675 | 1.205 | 2.807 |
| 2.463008640414302 | -4.722 | 1.286 | 2.72 |
| 2.469291825721482 | -4.771 | 1.367 | 2.631 |
| 2.475575011028661 | -4.819 | 1.449 | 2.539 |
| 2.481858196335841 | -4.867 | 1.532 | 2.446 |
| 2.48814138164302 | -4.915 | 1.615 | 2.351 |
| 2.4944245669502 | -4.964 | 1.698 | 2.254 |
| 2.50070775225738 | -5.013 | 1.782 | 2.155 |
| 2.506990937564559 | -5.061 | 1.867 | 2.054 |
| 2.51327412287174 | -5.11 | 1.952 | 1.952 |
| 2.519557308178919 | -5.159 | 2.037 | 1.848 |
| 2.525840493486098 | -5.208 | 2.123 | 1.741 |
| 2.532123678793278 | -5.257 | 2.21 | 1.634 |
| 2.538406864100458 | -5.306 | 2.297 | 1.524 |
| 2.544690049407637 | -5.356 | 2.384 | 1.413 |
| 2.550973234714817 | -5.405 | 2.471 | 1.3 |
| 2.557256420021996 | -5.455 | 2.559 | 1.185 |
| 2.563539605329176 | -5.504 | 2.648 | 1.069 |
| 2.569822790636356 | -5.554 | 2.737 | 0.951 |
| 2.576105975943535 | -5.603 | 2.826 | 0.832 |
| 2.582389161250715 | -5.653 | 2.915 | 0.711 |
| 2.588672346557895 | -5.703 | 3.005 | 0.589 |
| 2.594955531865074 | -5.753 | 3.095 | 0.465 |
| 2.601238717172254 | -5.802 | 3.185 | 0.34 |
| 2.607521902479433 | -5.852 | 3.276 | 0.214 |
| 2.613805087786613 | -5.902 | 3.366 | 0.086 |
| 2.620088273093793 | -5.952 | 3.457 | -0.043 |
| 2.626371458400972 | -6.002 | 3.549 | -0.173 |
| 2.632654643708152 | -6.052 | 3.64 | -0.305 |
| 2.638937829015332 | -6.103 | 3.731 | -0.437 |
| 2.645221014322511 | -6.153 | 3.823 | -0.571 |
| 2.651504199629691 | -6.203 | 3.915 | -0.706 |
| 2.657787384936871 | -6.253 | 4.007 | -0.841 |
| 2.66407057024405 | -6.303 | 4.099 | -0.978 |
| 2.67035375555123 | -6.354 | 4.191 | -1.116 |
| 2.67663694085841 | -6.404 | 4.284 | -1.254 |
| 2.682920126165589 | -6.454 | 4.376 | -1.393 |
| 2.689203311472769 | -6.504 | 4.468 | -1.533 |
| 2.695486496779948 | -6.555 | 4.561 | -1.674 |
| 2.701769682087128 | -6.605 | 4.653 | -1.815 |
| 2.708052867394308 | -6.655 | 4.745 | -1.957 |
| 2.714336052701487 | -6.705 | 4.837 | -2.1 |
| 2.720619238008667 | -6.756 | 4.93 | -2.243 |
| 2.726902423315847 | -6.806 | 5.022 | -2.387 |
| 2.733185608623026 | -6.856 | 5.114 | -2.53 |
| 2.739468793930206 | -6.906 | 5.206 | -2.675 |
| 2.745751979237386 | -6.956 | 5.297 | -2.819 |
| 2.752035164544565 | -7.006 | 5.389 | -2.964 |
| 2.758318349851745 | -7.056 | 5.48 | -3.109 |
| 2.764601535158925 | -7.106 | 5.572 | -3.254 |
| 2.770884720466104 | -7.156 | 5.662 | -3.399 |
| 2.777167905773284 | -7.206 | 5.753 | -3.545 |
| 2.783451091080463 | -7.256 | 5.844 | -3.69 |
| 2.789734276387643 | -7.306 | 5.934 | -3.835 |
| 2.796017461694823 | -7.356 | 6.024 | -3.98 |
| 2.802300647002002 | -7.405 | 6.113 | -4.124 |
| 2.808583832309182 | -7.455 | 6.202 | -4.268 |
| 2.814867017616362 | -7.504 | 6.291 | -4.412 |
| 2.821150202923541 | -7.554 | 6.38 | -4.556 |
| 2.827433388230721 | -7.603 | 6.468 | -4.699 |
| 2.833716573537901 | -7.652 | 6.555 | -4.841 |
| 2.83999975884508 | -7.702 | 6.642 | -4.983 |
| 2.84628294415226 | -7.751 | 6.729 | -5.125 |
| 2.852566129459439 | -7.8 | 6.815 | -5.265 |
| 2.858849314766619 | -7.848 | 6.901 | -5.405 |
| 2.865132500073799 | -7.897 | 6.986 | -5.544 |
| 2.871415685380978 | -7.946 | 7.07 | -5.682 |
| 2.877698870688158 | -7.994 | 7.154 | -5.819 |
| 2.883982055995337 | -8.043 | 7.238 | -5.955 |
| 2.890265241302517 | -8.091 | 7.32 | -6.09 |
| 2.896548426609697 | -8.139 | 7.402 | -6.223 |
| 2.902831611916877 | -8.187 | 7.484 | -6.356 |
| 2.909114797224056 | -8.235 | 7.565 | -6.487 |
| 2.915397982531236 | -8.283 | 7.645 | -6.617 |
| 2.921681167838416 | -8.331 | 7.724 | -6.745 |
| 2.927964353145595 | -8.378 | 7.802 | -6.872 |
| 2.934247538452775 | -8.425 | 7.88 | -6.997 |
| 2.940530723759954 | -8.473 | 7.957 | -7.121 |
| 2.946813909067134 | -8.52 | 8.033 | -7.243 |
| 2.953097094374314 | -8.566 | 8.108 | -7.363 |
| 2.959380279681493 | -8.613 | 8.183 | -7.482 |
| 2.965663464988673 | -8.659 | 8.256 | -7.598 |
| 2.971946650295853 | -8.706 | 8.329 | -7.713 |
| 2.978229835603032 | -8.752 | 8.401 | -7.826 |
| 2.984513020910212 | -8.798 | 8.471 | -7.936 |
| 2.990796206217391 | -8.843 | 8.541 | -8.045 |
| 2.997079391524571 | -8.889 | 8.61 | -8.151 |
| 3.003362576831751 | -8.934 | 8.678 | -8.256 |
| 3.009645762138931 | -8.979 | 8.744 | -8.358 |
| 3.01592894744611 | -9.024 | 8.81 | -8.457 |
| 3.02221213275329 | -9.069 | 8.875 | -8.554 |
| 3.028495318060469 | -9.113 | 8.938 | -8.649 |
| 3.034778503367649 | -9.157 | 9.001 | -8.741 |
| 3.041061688674829 | -9.201 | 9.062 | -8.831 |
| 3.047344873982008 | -9.245 | 9.122 | -8.918 |
| 3.053628059289188 | -9.289 | 9.181 | -9.002 |
| 3.059911244596367 | -9.332 | 9.238 | -9.083 |
| 3.066194429903547 | -9.375 | 9.295 | -9.162 |
| 3.072477615210727 | -9.418 | 9.35 | -9.238 |
| 3.078760800517906 | -9.46 | 9.404 | -9.311 |
| 3.085043985825086 | -9.502 | 9.457 | -9.381 |
| 3.091327171132266 | -9.544 | 9.508 | -9.448 |
| 3.097610356439445 | -9.586 | 9.558 | -9.512 |
| 3.103893541746625 | -9.627 | 9.607 | -9.573 |
| 3.110176727053805 | -9.668 | 9.654 | -9.63 |
| 3.116459912360984 | -9.709 | 9.7 | -9.685 |
| 3.122743097668164 | -9.75 | 9.745 | -9.736 |
| 3.129026282975343 | -9.79 | 9.788 | -9.784 |
| 3.135309468282523 | -9.83 | 9.829 | -9.828 |
| 3.141592653589703 | -9.87 | 9.87 | -9.87 |
| 3.147875838896883 | -9.909 | 9.908 | -9.907 |
| 3.154159024204062 | -9.948 | 9.946 | -9.942 |
| 3.160442209511242 | -9.987 | 9.981 | -9.972 |
| 3.166725394818422 | -10.025 | 10.015 | -10 |
| 3.173008580125601 | -10.063 | 10.048 | -10.023 |
| 3.179291765432781 | -10.101 | 10.079 | -10.043 |
| 3.18557495073996 | -10.138 | 10.109 | -10.06 |
| 3.19185813604714 | -10.175 | 10.137 | -10.072 |
| 3.19814132135432 | -10.212 | 10.163 | -10.081 |
| 3.2044245066615 | -10.248 | 10.187 | -10.086 |
| 3.210707691968679 | -10.284 | 10.21 | -10.088 |
| 3.216990877275859 | -10.32 | 10.232 | -10.085 |
| 3.223274062583038 | -10.355 | 10.251 | -10.079 |
| 3.229557247890217 | -10.39 | 10.269 | -10.069 |
| 3.235840433197398 | -10.424 | 10.285 | -10.055 |
| 3.242123618504577 | -10.458 | 10.3 | -10.037 |
| 3.248406803811757 | -10.492 | 10.312 | -10.015 |
| 3.254689989118936 | -10.525 | 10.323 | -9.989 |
| 3.260973174426116 | -10.558 | 10.332 | -9.959 |
| 3.267256359733296 | -10.591 | 10.34 | -9.925 |
| 3.273539545040475 | -10.623 | 10.345 | -9.887 |
| 3.279822730347655 | -10.655 | 10.349 | -9.845 |
| 3.286105915654835 | -10.686 | 10.351 | -9.799 |
| 3.292389100962014 | -10.717 | 10.351 | -9.749 |
| 3.298672286269194 | -10.747 | 10.349 | -9.695 |
| 3.304955471576374 | -10.777 | 10.345 | -9.637 |
| 3.311238656883553 | -10.807 | 10.339 | -9.575 |
| 3.317521842190732 | -10.836 | 10.332 | -9.508 |
| 3.323805027497912 | -10.865 | 10.322 | -9.438 |
| 3.330088212805092 | -10.893 | 10.311 | -9.363 |
| 3.336371398112272 | -10.921 | 10.297 | -9.284 |
| 3.342654583419451 | -10.948 | 10.282 | -9.202 |
| 3.34893776872663 | -10.975 | 10.265 | -9.115 |
| 3.355220954033811 | -11.002 | 10.246 | -9.024 |
| 3.36150413934099 | -11.028 | 10.224 | -8.929 |
| 3.36778732464817 | -11.053 | 10.201 | -8.829 |
| 3.37407050995535 | -11.078 | 10.176 | -8.726 |
| 3.380353695262529 | -11.103 | 10.149 | -8.619 |
| 3.386636880569709 | -11.127 | 10.119 | -8.507 |
| 3.392920065876888 | -11.15 | 10.088 | -8.392 |
| 3.399203251184068 | -11.173 | 10.055 | -8.272 |
| 3.405486436491248 | -11.196 | 10.019 | -8.149 |
| 3.411769621798427 | -11.218 | 9.982 | -8.021 |
| 3.418052807105607 | -11.239 | 9.942 | -7.89 |
| 3.424335992412787 | -11.26 | 9.901 | -7.755 |
| 3.430619177719966 | -11.281 | 9.857 | -7.615 |
| 3.436902363027146 | -11.301 | 9.811 | -7.472 |
| 3.443185548334325 | -11.32 | 9.763 | -7.325 |
| 3.449468733641505 | -11.339 | 9.713 | -7.174 |
| 3.455751918948685 | -11.358 | 9.661 | -7.019 |
| 3.462035104255865 | -11.376 | 9.607 | -6.861 |
| 3.468318289563044 | -11.393 | 9.551 | -6.699 |
| 3.474601474870224 | -11.41 | 9.493 | -6.533 |
| 3.480884660177403 | -11.426 | 9.432 | -6.363 |
| 3.487167845484583 | -11.441 | 9.37 | -6.19 |
| 3.493451030791763 | -11.456 | 9.305 | -6.013 |
| 3.499734216098942 | -11.471 | 9.238 | -5.833 |
| 3.506017401406122 | -11.485 | 9.169 | -5.649 |
| 3.512300586713302 | -11.498 | 9.098 | -5.462 |
| 3.518583772020481 | -11.511 | 9.025 | -5.271 |
| 3.524866957327661 | -11.523 | 8.95 | -5.077 |
| 3.531150142634841 | -11.535 | 8.872 | -4.88 |
| 3.53743332794202 | -11.546 | 8.793 | -4.68 |
| 3.5437165132492 | -11.556 | 8.711 | -4.476 |
| 3.54999969855638 | -11.566 | 8.627 | -4.269 |
| 3.556282883863559 | -11.575 | 8.541 | -4.059 |
| 3.562566069170739 | -11.584 | 8.453 | -3.846 |
| 3.568849254477918 | -11.592 | 8.363 | -3.63 |
| 3.575132439785098 | -11.599 | 8.27 | -3.411 |
| 3.581415625092278 | -11.606 | 8.176 | -3.19 |
| 3.587698810399457 | -11.612 | 8.079 | -2.965 |
| 3.593981995706637 | -11.617 | 7.981 | -2.738 |
| 3.600265181013817 | -11.622 | 7.88 | -2.509 |
| 3.606548366320996 | -11.626 | 7.777 | -2.277 |
| 3.612831551628176 | -11.63 | 7.672 | -2.042 |
| 3.619114736935355 | -11.633 | 7.565 | -1.805 |
| 3.625397922242535 | -11.635 | 7.456 | -1.565 |
| 3.631681107549715 | -11.637 | 7.345 | -1.324 |
| 3.637964292856894 | -11.638 | 7.231 | -1.08 |
| 3.644247478164074 | -11.638 | 7.116 | -0.834 |
| 3.650530663471254 | -11.637 | 6.999 | -0.586 |
| 3.656813848778433 | -11.636 | 6.879 | -0.336 |
| 3.663097034085613 | -11.635 | 6.758 | -0.084 |
| 3.669380219392792 | -11.632 | 6.634 | 0.169 |
| 3.675663404699972 | -11.629 | 6.509 | 0.424 |
| 3.681946590007152 | -11.625 | 6.381 | 0.681 |
| 3.688229775314331 | -11.621 | 6.252 | 0.939 |
| 3.694512960621511 | -11.616 | 6.12 | 1.199 |
| 3.700796145928691 | -11.61 | 5.987 | 1.46 |
| 3.70707933123587 | -11.603 | 5.851 | 1.722 |
| 3.71336251654305 | -11.596 | 5.714 | 1.986 |
| 3.71964570185023 | -11.588 | 5.575 | 2.25 |
| 3.72592888715741 | -11.579 | 5.433 | 2.516 |
| 3.732212072464589 | -11.57 | 5.29 | 2.782 |
| 3.738495257771769 | -11.56 | 5.145 | 3.049 |
| 3.744778443078948 | -11.549 | 4.998 | 3.317 |
| 3.751061628386128 | -11.537 | 4.849 | 3.585 |
| 3.757344813693308 | -11.525 | 4.699 | 3.853 |
| 3.763627999000487 | -11.512 | 4.546 | 4.122 |
| 3.769911184307667 | -11.498 | 4.392 | 4.392 |
| 3.776194369614846 | -11.483 | 4.236 | 4.661 |
| 3.782477554922026 | -11.468 | 4.078 | 4.931 |
| 3.788760740229206 | -11.452 | 3.918 | 5.2 |
| 3.795043925536385 | -11.435 | 3.757 | 5.47 |
| 3.801327110843565 | -11.418 | 3.594 | 5.739 |
| 3.807610296150745 | -11.4 | 3.429 | 6.008 |
| 3.813893481457924 | -11.38 | 3.262 | 6.276 |
| 3.820176666765104 | -11.361 | 3.094 | 6.544 |
| 3.826459852072284 | -11.34 | 2.924 | 6.811 |
| 3.832743037379463 | -11.319 | 2.753 | 7.077 |
| 3.839026222686643 | -11.297 | 2.58 | 7.342 |
| 3.845309407993823 | -11.274 | 2.405 | 7.607 |
| 3.851592593301002 | -11.25 | 2.229 | 7.87 |
| 3.857875778608182 | -11.226 | 2.051 | 8.132 |
| 3.864158963915361 | -11.2 | 1.871 | 8.393 |
| 3.870442149222541 | -11.174 | 1.691 | 8.652 |
| 3.876725334529721 | -11.148 | 1.508 | 8.91 |
| 3.8830085198369 | -11.12 | 1.325 | 9.166 |
| 3.88929170514408 | -11.092 | 1.139 | 9.421 |
| 3.89557489045126 | -11.062 | 0.953 | 9.673 |
| 3.901858075758439 | -11.032 | 0.765 | 9.924 |
| 3.908141261065619 | -11.002 | 0.576 | 10.172 |
| 3.914424446372799 | -10.97 | 0.385 | 10.419 |
| 3.920707631679978 | -10.938 | 0.193 | 10.663 |
| 3.926990816987158 | -10.904 | 0 | 10.904 |
| 3.933274002294337 | -10.87 | -0.194 | 11.144 |
| 3.939557187601517 | -10.836 | -0.39 | 11.38 |
| 3.945840372908697 | -10.8 | -0.587 | 11.614 |
| 3.952123558215876 | -10.763 | -0.785 | 11.845 |
| 3.958406743523056 | -10.726 | -0.984 | 12.073 |
| 3.964689928830236 | -10.688 | -1.184 | 12.298 |
| 3.970973114137415 | -10.649 | -1.385 | 12.52 |
| 3.977256299444595 | -10.609 | -1.588 | 12.739 |
| 3.983539484751775 | -10.569 | -1.791 | 12.954 |
| 3.989822670058954 | -10.527 | -1.995 | 13.166 |
| 3.996105855366134 | -10.485 | -2.2 | 13.374 |
| 4.002389040673314 | -10.442 | -2.406 | 13.579 |
| 4.008672225980493 | -10.398 | -2.613 | 13.78 |
| 4.014955411287672 | -10.353 | -2.821 | 13.977 |
| 4.021238596594851 | -10.307 | -3.03 | 14.17 |
| 4.02752178190203 | -10.261 | -3.239 | 14.359 |
| 4.03380496720921 | -10.214 | -3.45 | 14.544 |
| 4.040088152516389 | -10.165 | -3.661 | 14.725 |
| 4.046371337823567 | -10.116 | -3.872 | 14.901 |
| 4.052654523130747 | -10.066 | -4.084 | 15.073 |
| 4.058937708437926 | -10.016 | -4.297 | 15.241 |
| 4.065220893745105 | -9.964 | -4.511 | 15.403 |
| 4.071504079052285 | -9.912 | -4.725 | 15.562 |
| 4.077787264359464 | -9.858 | -4.939 | 15.715 |
| 4.084070449666643 | -9.804 | -5.154 | 15.863 |
| 4.090353634973822 | -9.749 | -5.37 | 16.007 |
| 4.096636820281001 | -9.693 | -5.586 | 16.145 |
| 4.102920005588181 | -9.636 | -5.802 | 16.278 |
| 4.10920319089536 | -9.579 | -6.018 | 16.407 |
| 4.115486376202539 | -9.52 | -6.235 | 16.529 |
| 4.121769561509718 | -9.461 | -6.452 | 16.647 |
| 4.128052746816897 | -9.4 | -6.669 | 16.759 |
| 4.134335932124077 | -9.339 | -6.887 | 16.865 |
| 4.140619117431256 | -9.277 | -7.104 | 16.966 |
| 4.146902302738435 | -9.215 | -7.322 | 17.061 |
| 4.153185488045614 | -9.151 | -7.54 | 17.151 |
| 4.159468673352793 | -9.086 | -7.758 | 17.234 |
| 4.165751858659973 | -9.021 | -7.975 | 17.312 |
| 4.172035043967152 | -8.954 | -8.193 | 17.384 |
| 4.178318229274331 | -8.887 | -8.411 | 17.45 |
| 4.18460141458151 | -8.819 | -8.628 | 17.51 |
| 4.190884599888689 | -8.75 | -8.845 | 17.563 |
| 4.197167785195868 | -8.68 | -9.062 | 17.611 |
| 4.203450970503048 | -8.609 | -9.279 | 17.652 |
| 4.209734155810227 | -8.538 | -9.496 | 17.687 |
| 4.216017341117406 | -8.465 | -9.712 | 17.716 |
| 4.222300526424585 | -8.392 | -9.928 | 17.738 |
| 4.228583711731764 | -8.317 | -10.143 | 17.754 |
| 4.234866897038944 | -8.242 | -10.358 | 17.763 |
| 4.241150082346122 | -8.166 | -10.573 | 17.766 |
| 4.247433267653302 | -8.089 | -10.787 | 17.762 |
| 4.253716452960481 | -8.011 | -11 | 17.752 |
| 4.25999963826766 | -7.933 | -11.213 | 17.735 |
| 4.26628282357484 | -7.853 | -11.425 | 17.712 |
| 4.272566008882019 | -7.773 | -11.636 | 17.681 |
| 4.278849194189198 | -7.691 | -11.847 | 17.644 |
| 4.285132379496377 | -7.609 | -12.056 | 17.601 |
| 4.291415564803557 | -7.526 | -12.265 | 17.55 |
| 4.297698750110735 | -7.442 | -12.474 | 17.493 |
| 4.303981935417915 | -7.357 | -12.681 | 17.429 |
| 4.310265120725094 | -7.271 | -12.887 | 17.358 |
| 4.316548306032273 | -7.184 | -13.092 | 17.281 |
| 4.322831491339452 | -7.097 | -13.296 | 17.196 |
| 4.329114676646632 | -7.008 | -13.499 | 17.105 |
| 4.335397861953811 | -6.919 | -13.701 | 17.007 |
| 4.34168104726099 | -6.829 | -13.902 | 16.902 |
| 4.347964232568169 | -6.738 | -14.102 | 16.79 |
| 4.354247417875348 | -6.646 | -14.3 | 16.671 |
| 4.360530603182528 | -6.553 | -14.497 | 16.546 |
| 4.366813788489707 | -6.459 | -14.693 | 16.414 |
| 4.373096973796886 | -6.365 | -14.887 | 16.274 |
| 4.379380159104065 | -6.269 | -15.08 | 16.128 |
| 4.385663344411244 | -6.173 | -15.272 | 15.976 |
| 4.391946529718424 | -6.076 | -15.462 | 15.816 |
| 4.398229715025602 | -5.978 | -15.65 | 15.65 |
| 4.404512900332782 | -5.879 | -15.837 | 15.477 |
| 4.41079608563996 | -5.779 | -16.022 | 15.297 |
| 4.41707927094714 | -5.678 | -16.205 | 15.111 |
| 4.42336245625432 | -5.577 | -16.387 | 14.918 |
| 4.429645641561499 | -5.474 | -16.567 | 14.718 |
| 4.435928826868678 | -5.371 | -16.745 | 14.512 |
| 4.442212012175857 | -5.267 | -16.922 | 14.3 |
| 4.448495197483036 | -5.162 | -17.096 | 14.081 |
| 4.454778382790215 | -5.056 | -17.269 | 13.855 |
| 4.461061568097395 | -4.949 | -17.439 | 13.623 |
| 4.467344753404574 | -4.842 | -17.608 | 13.385 |
| 4.473627938711753 | -4.733 | -17.775 | 13.14 |
| 4.479911124018932 | -4.624 | -17.939 | 12.89 |
| 4.486194309326112 | -4.514 | -18.101 | 12.633 |
| 4.49247749463329 | -4.403 | -18.262 | 12.37 |
| 4.49876067994047 | -4.291 | -18.419 | 12.101 |
| 4.50504386524765 | -4.178 | -18.575 | 11.826 |
| 4.511327050554828 | -4.065 | -18.729 | 11.545 |
| 4.517610235862008 | -3.95 | -18.88 | 11.258 |
| 4.523893421169186 | -3.835 | -19.028 | 10.966 |
| 4.530176606476366 | -3.719 | -19.175 | 10.668 |
| 4.536459791783545 | -3.602 | -19.319 | 10.364 |
| 4.542742977090724 | -3.484 | -19.46 | 10.055 |
| 4.549026162397904 | -3.366 | -19.599 | 9.741 |
| 4.555309347705083 | -3.246 | -19.735 | 9.421 |
| 4.561592533012262 | -3.126 | -19.869 | 9.096 |
| 4.567875718319441 | -3.005 | -20 | 8.765 |
| 4.57415890362662 | -2.883 | -20.128 | 8.43 |
| 4.5804420889338 | -2.76 | -20.254 | 8.09 |
| 4.586725274240979 | -2.637 | -20.377 | 7.745 |
| 4.593008459548158 | -2.512 | -20.497 | 7.395 |
| 4.599291644855337 | -2.387 | -20.615 | 7.04 |
| 4.605574830162516 | -2.261 | -20.729 | 6.681 |
| 4.611858015469695 | -2.135 | -20.841 | 6.318 |
| 4.618141200776875 | -2.007 | -20.949 | 5.95 |
| 4.624424386084054 | -1.879 | -21.055 | 5.578 |
| 4.630707571391233 | -1.75 | -21.158 | 5.202 |
| 4.636990756698412 | -1.62 | -21.258 | 4.822 |
| 4.643273942005591 | -1.489 | -21.354 | 4.438 |
| 4.649557127312771 | -1.357 | -21.448 | 4.051 |
| 4.65584031261995 | -1.225 | -21.538 | 3.66 |
| 4.66212349792713 | -1.092 | -21.626 | 3.265 |
| 4.668406683234308 | -0.958 | -21.71 | 2.867 |
| 4.674689868541487 | -0.824 | -21.791 | 2.466 |
| 4.680973053848666 | -0.688 | -21.868 | 2.062 |
| 4.687256239155846 | -0.552 | -21.943 | 1.655 |
| 4.693539424463024 | -0.415 | -22.014 | 1.245 |
| 4.699822609770204 | -0.278 | -22.081 | 0.833 |
| 4.706105795077383 | -0.139 | -22.146 | 0.417 |
| 4.712388980384562 | 0 | -22.207 | 0 |
| 4.718672165691741 | 0.14 | -22.264 | -0.42 |
| 4.724955350998921 | 0.281 | -22.318 | -0.841 |
| 4.7312385363061 | 0.422 | -22.369 | -1.265 |
| 4.73752172161328 | 0.564 | -22.416 | -1.691 |
| 4.743804906920459 | 0.707 | -22.459 | -2.118 |
| 4.750088092227637 | 0.85 | -22.499 | -2.546 |
| 4.756371277534817 | 0.995 | -22.536 | -2.976 |
| 4.762654462841996 | 1.14 | -22.568 | -3.408 |
| 4.768937648149175 | 1.285 | -22.597 | -3.84 |
| 4.775220833456354 | 1.432 | -22.623 | -4.273 |
| 4.781504018763534 | 1.579 | -22.645 | -4.707 |
| 4.787787204070713 | 1.727 | -22.663 | -5.141 |
| 4.794070389377892 | 1.875 | -22.677 | -5.576 |
| 4.800353574685071 | 2.024 | -22.688 | -6.011 |
| 4.806636759992251 | 2.174 | -22.695 | -6.446 |
| 4.81291994529943 | 2.325 | -22.698 | -6.881 |
| 4.819203130606608 | 2.476 | -22.697 | -7.315 |
| 4.825486315913788 | 2.628 | -22.692 | -7.75 |
| 4.831769501220967 | 2.78 | -22.684 | -8.184 |
| 4.838052686528146 | 2.934 | -22.671 | -8.617 |
| 4.844335871835326 | 3.087 | -22.655 | -9.049 |
| 4.850619057142505 | 3.242 | -22.635 | -9.48 |
| 4.856902242449684 | 3.397 | -22.611 | -9.91 |
| 4.863185427756863 | 3.553 | -22.583 | -10.338 |
| 4.869468613064042 | 3.709 | -22.551 | -10.765 |
| 4.875751798371221 | 3.866 | -22.515 | -11.19 |
| 4.882034983678401 | 4.024 | -22.475 | -11.613 |
| 4.88831816898558 | 4.182 | -22.432 | -12.034 |
| 4.894601354292759 | 4.341 | -22.384 | -12.453 |
| 4.900884539599939 | 4.501 | -22.332 | -12.87 |
| 4.907167724907117 | 4.661 | -22.276 | -13.284 |
| 4.913450910214297 | 4.821 | -22.216 | -13.695 |
| 4.919734095521476 | 4.983 | -22.152 | -14.103 |
| 4.926017280828655 | 5.144 | -22.084 | -14.509 |
| 4.932300466135834 | 5.307 | -22.012 | -14.911 |
| 4.938583651443014 | 5.47 | -21.936 | -15.309 |
| 4.944866836750193 | 5.633 | -21.856 | -15.704 |
| 4.951150022057372 | 5.798 | -21.772 | -16.095 |
| 4.957433207364551 | 5.962 | -21.683 | -16.483 |
| 4.96371639267173 | 6.127 | -21.591 | -16.866 |
| 4.96999957797891 | 6.293 | -21.494 | -17.245 |
| 4.976282763286088 | 6.459 | -21.394 | -17.62 |
| 4.982565948593268 | 6.626 | -21.289 | -17.99 |
| 4.988849133900447 | 6.793 | -21.18 | -18.356 |
| 4.995132319207626 | 6.961 | -21.067 | -18.716 |
| 5.001415504514805 | 7.13 | -20.95 | -19.072 |
| 5.007698689821984 | 7.298 | -20.829 | -19.422 |
| 5.013981875129164 | 7.468 | -20.704 | -19.767 |
| 5.020265060436343 | 7.637 | -20.574 | -20.107 |
| 5.026548245743522 | 7.808 | -20.441 | -20.441 |
| 5.032831431050702 | 7.978 | -20.303 | -20.769 |
| 5.039114616357881 | 8.15 | -20.162 | -21.091 |
| 5.04539780166506 | 8.321 | -20.016 | -21.407 |
| 5.05168098697224 | 8.493 | -19.866 | -21.717 |
| 5.057964172279418 | 8.666 | -19.712 | -22.02 |
| 5.064247357586598 | 8.839 | -19.554 | -22.317 |
| 5.070530542893777 | 9.012 | -19.392 | -22.607 |
| 5.076813728200956 | 9.186 | -19.226 | -22.891 |
| 5.083096913508135 | 9.36 | -19.056 | -23.167 |
| 5.089380098815314 | 9.535 | -18.882 | -23.437 |
| 5.095663284122493 | 9.71 | -18.703 | -23.699 |
| 5.101946469429673 | 9.886 | -18.521 | -23.954 |
| 5.108229654736852 | 10.061 | -18.335 | -24.201 |
| 5.114512840044031 | 10.238 | -18.145 | -24.44 |
| 5.12079602535121 | 10.414 | -17.951 | -24.672 |
| 5.12707921065839 | 10.591 | -17.752 | -24.896 |
| 5.133362395965568 | 10.768 | -17.55 | -25.112 |
| 5.139645581272747 | 10.946 | -17.344 | -25.32 |
| 5.145928766579927 | 11.124 | -17.134 | -25.52 |
| 5.152211951887106 | 11.302 | -16.921 | -25.711 |
| 5.158495137194286 | 11.481 | -16.703 | -25.894 |
| 5.164778322501465 | 11.66 | -16.481 | -26.069 |
| 5.171061507808644 | 11.839 | -16.256 | -26.234 |
| 5.177344693115823 | 12.019 | -16.027 | -26.391 |
| 5.183627878423002 | 12.199 | -15.794 | -26.539 |
| 5.189911063730181 | 12.379 | -15.557 | -26.678 |
| 5.196194249037361 | 12.559 | -15.317 | -26.808 |
| 5.20247743434454 | 12.74 | -15.072 | -26.929 |
| 5.20876061965172 | 12.921 | -14.824 | -27.041 |
| 5.215043804958898 | 13.102 | -14.573 | -27.143 |
| 5.221326990266077 | 13.284 | -14.317 | -27.236 |
| 5.227610175573257 | 13.465 | -14.059 | -27.319 |
| 5.233893360880435 | 13.647 | -13.796 | -27.393 |
| 5.240176546187615 | 13.829 | -13.53 | -27.457 |
| 5.246459731494794 | 14.012 | -13.26 | -27.512 |
| 5.252742916801973 | 14.194 | -12.987 | -27.556 |
| 5.259026102109152 | 14.377 | -12.711 | -27.591 |
| 5.265309287416332 | 14.56 | -12.431 | -27.616 |
| 5.27159247272351 | 14.743 | -12.147 | -27.631 |
| 5.27787565803069 | 14.926 | -11.86 | -27.636 |
| 5.284158843337869 | 15.109 | -11.57 | -27.631 |
| 5.290442028645049 | 15.293 | -11.277 | -27.616 |
| 5.296725213952227 | 15.477 | -10.98 | -27.591 |
| 5.303008399259407 | 15.66 | -10.68 | -27.555 |
| 5.309291584566586 | 15.844 | -10.377 | -27.51 |
| 5.315574769873765 | 16.028 | -10.071 | -27.454 |
| 5.321857955180945 | 16.213 | -9.761 | -27.388 |
| 5.328141140488124 | 16.397 | -9.448 | -27.311 |
| 5.334424325795303 | 16.581 | -9.133 | -27.224 |
| 5.340707511102482 | 16.765 | -8.814 | -27.127 |
| 5.346990696409661 | 16.95 | -8.493 | -27.02 |
| 5.35327388171684 | 17.134 | -8.168 | -26.902 |
| 5.35955706702402 | 17.319 | -7.841 | -26.774 |
| 5.365840252331199 | 17.504 | -7.51 | -26.635 |
| 5.372123437638378 | 17.688 | -7.177 | -26.486 |
| 5.378406622945557 | 17.873 | -6.841 | -26.327 |
| 5.384689808252737 | 18.058 | -6.503 | -26.157 |
| 5.390972993559916 | 18.242 | -6.161 | -25.977 |
| 5.397256178867095 | 18.427 | -5.818 | -25.787 |
| 5.403539364174274 | 18.612 | -5.471 | -25.587 |
| 5.409822549481453 | 18.796 | -5.122 | -25.376 |
| 5.416105734788632 | 18.981 | -4.771 | -25.155 |
| 5.422388920095812 | 19.165 | -4.417 | -24.924 |
| 5.42867210540299 | 19.35 | -4.061 | -24.682 |
| 5.43495529071017 | 19.534 | -3.702 | -24.431 |
| 5.44123847601735 | 19.719 | -3.341 | -24.169 |
| 5.447521661324528 | 19.903 | -2.978 | -23.898 |
| 5.453804846631708 | 20.087 | -2.613 | -23.616 |
| 5.460088031938887 | 20.271 | -2.246 | -23.325 |
| 5.466371217246066 | 20.455 | -1.876 | -23.024 |
| 5.472654402553245 | 20.639 | -1.505 | -22.713 |
| 5.478937587860424 | 20.823 | -1.131 | -22.392 |
| 5.485220773167603 | 21.006 | -0.756 | -22.062 |
| 5.491503958474783 | 21.19 | -0.379 | -21.722 |
| 5.497787143781962 | 21.373 | 0 | -21.373 |
| 5.504070329089141 | 21.556 | 0.381 | -21.014 |
| 5.51035351439632 | 21.739 | 0.763 | -20.646 |
| 5.5166366997035 | 21.921 | 1.147 | -20.269 |
| 5.522919885010679 | 22.104 | 1.533 | -19.883 |
| 5.529203070317858 | 22.286 | 1.92 | -19.487 |
| 5.535486255625037 | 22.468 | 2.308 | -19.083 |
| 5.541769440932216 | 22.65 | 2.698 | -18.67 |
| 5.548052626239396 | 22.831 | 3.089 | -18.249 |
| 5.554335811546575 | 23.013 | 3.482 | -17.818 |
| 5.560618996853754 | 23.194 | 3.875 | -17.38 |
| 5.566902182160933 | 23.375 | 4.27 | -16.933 |
| 5.573185367468112 | 23.555 | 4.666 | -16.478 |
| 5.579468552775292 | 23.735 | 5.063 | -16.015 |
| 5.585751738082471 | 23.915 | 5.461 | -15.544 |
| 5.59203492338965 | 24.095 | 5.86 | -15.065 |
| 5.59831810869683 | 24.274 | 6.259 | -14.578 |
| 5.604601294004008 | 24.453 | 6.659 | -14.084 |
| 5.610884479311188 | 24.631 | 7.06 | -13.583 |
| 5.617167664618367 | 24.809 | 7.462 | -13.075 |
| 5.623450849925546 | 24.987 | 7.864 | -12.559 |
| 5.629734035232725 | 25.165 | 8.267 | -12.037 |
| 5.636017220539904 | 25.342 | 8.67 | -11.508 |
| 5.642300405847083 | 25.518 | 9.074 | -10.972 |
| 5.648583591154263 | 25.695 | 9.478 | -10.43 |
| 5.654866776461442 | 25.87 | 9.882 | -9.882 |
| 5.661149961768621 | 26.046 | 10.286 | -9.327 |
| 5.6674331470758 | 26.221 | 10.69 | -8.767 |
| 5.673716332382979 | 26.395 | 11.094 | -8.201 |
| 5.679999517690159 | 26.569 | 11.499 | -7.63 |
| 5.686282702997337 | 26.743 | 11.903 | -7.053 |
| 5.692565888304517 | 26.916 | 12.307 | -6.472 |
| 5.698849073611696 | 27.088 | 12.711 | -5.885 |
| 5.705132258918875 | 27.26 | 13.114 | -5.294 |
| 5.711415444226055 | 27.432 | 13.517 | -4.698 |
| 5.717698629533234 | 27.603 | 13.92 | -4.097 |
| 5.723981814840413 | 27.773 | 14.322 | -3.493 |
| 5.730265000147592 | 27.943 | 14.723 | -2.885 |
| 5.73654818545477 | 28.113 | 15.124 | -2.273 |
| 5.742831370761951 | 28.281 | 15.524 | -1.657 |
| 5.74911455606913 | 28.45 | 15.923 | -1.038 |
| 5.75539774137631 | 28.617 | 16.321 | -0.416 |
| 5.761680926683488 | 28.784 | 16.719 | 0.209 |
| 5.767964111990667 | 28.951 | 17.115 | 0.836 |
| 5.774247297297846 | 29.116 | 17.51 | 1.466 |
| 5.780530482605025 | 29.281 | 17.904 | 2.098 |
| 5.786813667912205 | 29.446 | 18.297 | 2.732 |
| 5.793096853219384 | 29.61 | 18.689 | 3.368 |
| 5.799380038526563 | 29.773 | 19.079 | 4.006 |
| 5.805663223833742 | 29.935 | 19.468 | 4.644 |
| 5.811946409140922 | 30.097 | 19.855 | 5.284 |
| 5.8182295944481 | 30.258 | 20.24 | 5.925 |
| 5.82451277975528 | 30.419 | 20.624 | 6.566 |
| 5.830795965062459 | 30.578 | 21.006 | 7.208 |
| 5.837079150369638 | 30.737 | 21.386 | 7.85 |
| 5.843362335676817 | 30.895 | 21.765 | 8.491 |
| 5.849645520983997 | 31.053 | 22.141 | 9.133 |
| 5.855928706291176 | 31.209 | 22.516 | 9.774 |
| 5.862211891598355 | 31.365 | 22.888 | 10.414 |
| 5.868495076905535 | 31.52 | 23.258 | 11.053 |
| 5.874778262212714 | 31.674 | 23.626 | 11.691 |
| 5.881061447519893 | 31.828 | 23.991 | 12.327 |
| 5.887344632827072 | 31.981 | 24.354 | 12.962 |
| 5.893627818134251 | 32.132 | 24.715 | 13.594 |
| 5.899911003441431 | 32.283 | 25.073 | 14.225 |
| 5.90619418874861 | 32.434 | 25.429 | 14.853 |
| 5.912477374055789 | 32.583 | 25.782 | 15.478 |
| 5.918760559362968 | 32.731 | 26.132 | 16.1 |
| 5.925043744670147 | 32.879 | 26.479 | 16.719 |
| 5.931326929977326 | 33.025 | 26.823 | 17.334 |
| 5.937610115284505 | 33.171 | 27.165 | 17.946 |
| 5.943893300591684 | 33.316 | 27.503 | 18.554 |
| 5.950176485898864 | 33.46 | 27.838 | 19.158 |
| 5.956459671206043 | 33.602 | 28.17 | 19.758 |
| 5.962742856513223 | 33.744 | 28.499 | 20.352 |
| 5.969026041820402 | 33.885 | 28.825 | 20.942 |
| 5.975309227127581 | 34.025 | 29.147 | 21.527 |
| 5.98159241243476 | 34.165 | 29.466 | 22.107 |
| 5.987875597741939 | 34.303 | 29.781 | 22.681 |
| 5.994158783049118 | 34.44 | 30.092 | 23.249 |
| 6.000441968356298 | 34.576 | 30.4 | 23.811 |
| 6.006725153663476 | 34.711 | 30.705 | 24.367 |
| 6.013008338970656 | 34.845 | 31.005 | 24.916 |
| 6.019291524277835 | 34.978 | 31.302 | 25.458 |
| 6.025574709585015 | 35.109 | 31.594 | 25.994 |
| 6.031857894892193 | 35.24 | 31.883 | 26.522 |
| 6.038141080199372 | 35.37 | 32.168 | 27.043 |
| 6.044424265506552 | 35.499 | 32.448 | 27.557 |
| 6.050707450813731 | 35.626 | 32.724 | 28.062 |
| 6.05699063612091 | 35.753 | 32.997 | 28.56 |
| 6.06327382142809 | 35.878 | 33.264 | 29.049 |
| 6.069557006735269 | 36.002 | 33.528 | 29.529 |
| 6.075840192042448 | 36.125 | 33.787 | 30.001 |
| 6.082123377349627 | 36.247 | 34.041 | 30.464 |
| 6.088406562656806 | 36.368 | 34.291 | 30.918 |
| 6.094689747963986 | 36.487 | 34.537 | 31.363 |
| 6.100972933271164 | 36.606 | 34.777 | 31.798 |
| 6.107256118578344 | 36.723 | 35.013 | 32.223 |
| 6.113539303885523 | 36.839 | 35.245 | 32.639 |
| 6.119822489192702 | 36.954 | 35.471 | 33.044 |
| 6.126105674499882 | 37.067 | 35.692 | 33.439 |
| 6.132388859807061 | 37.179 | 35.909 | 33.823 |
| 6.13867204511424 | 37.29 | 36.12 | 34.197 |
| 6.144955230421419 | 37.4 | 36.327 | 34.56 |
| 6.151238415728598 | 37.509 | 36.528 | 34.912 |
| 6.157521601035778 | 37.616 | 36.724 | 35.253 |
| 6.163804786342957 | 37.722 | 36.915 | 35.582 |
| 6.170087971650136 | 37.827 | 37.1 | 35.9 |
| 6.176371156957315 | 37.93 | 37.28 | 36.206 |
| 6.182654342264494 | 38.032 | 37.455 | 36.5 |
| 6.188937527571674 | 38.133 | 37.624 | 36.782 |
| 6.195220712878853 | 38.232 | 37.788 | 37.052 |
| 6.201503898186032 | 38.33 | 37.947 | 37.31 |
| 6.207787083493211 | 38.427 | 38.099 | 37.555 |
| 6.21407026880039 | 38.522 | 38.246 | 37.788 |
| 6.22035345410757 | 38.616 | 38.388 | 38.007 |
| 6.226636639414749 | 38.709 | 38.523 | 38.214 |
| 6.232919824721928 | 38.8 | 38.653 | 38.408 |
| 6.239203010029107 | 38.89 | 38.777 | 38.589 |
| 6.245486195336286 | 38.978 | 38.895 | 38.757 |
| 6.251769380643465 | 39.065 | 39.007 | 38.911 |
| 6.258052565950644 | 39.151 | 39.114 | 39.052 |
| 6.264335751257824 | 39.235 | 39.214 | 39.179 |
| 6.270618936565003 | 39.318 | 39.308 | 39.293 |
| 6.276902121872182 | 39.399 | 39.396 | 39.393 |
| 6.283185307179361 | 39.478 | 39.478 | 39.478 |